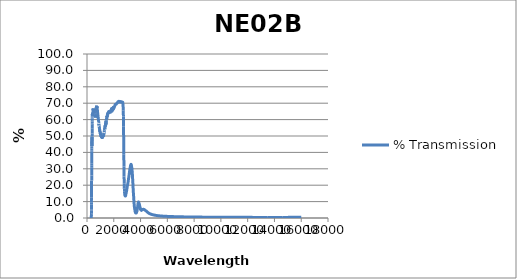
| Category | % Transmission |
|---|---|
| 200.0 | 0.013 |
| 201.0 | 0.013 |
| 202.0 | 0.013 |
| 203.0 | 0.013 |
| 204.0 | 0.012 |
| 205.0 | 0.012 |
| 206.0 | 0.012 |
| 207.0 | 0.012 |
| 208.0 | 0.012 |
| 209.0 | 0.012 |
| 210.0 | 0.012 |
| 211.0 | 0.012 |
| 212.0 | 0.012 |
| 213.0 | 0.012 |
| 214.0 | 0.012 |
| 215.0 | 0.011 |
| 216.0 | 0.011 |
| 217.0 | 0.011 |
| 218.0 | 0.011 |
| 219.0 | 0.011 |
| 220.0 | 0.011 |
| 221.0 | 0.011 |
| 222.0 | 0.011 |
| 223.0 | 0.011 |
| 224.0 | 0.011 |
| 225.0 | 0.011 |
| 226.0 | 0.011 |
| 227.0 | 0.01 |
| 228.0 | 0.01 |
| 229.0 | 0.01 |
| 230.0 | 0.01 |
| 231.0 | 0.01 |
| 232.0 | 0.01 |
| 233.0 | 0.01 |
| 234.0 | 0.01 |
| 235.0 | 0.01 |
| 236.0 | 0.01 |
| 237.0 | 0.01 |
| 238.0 | 0.01 |
| 239.0 | 0.01 |
| 240.0 | 0.01 |
| 241.0 | 0.01 |
| 242.0 | 0.01 |
| 243.0 | 0.009 |
| 244.0 | 0.009 |
| 245.0 | 0.009 |
| 246.0 | 0.009 |
| 247.0 | 0.009 |
| 248.0 | 0.009 |
| 249.0 | 0.009 |
| 250.0 | 0.009 |
| 251.0 | 0.009 |
| 252.0 | 0.009 |
| 253.0 | 0.009 |
| 254.0 | 0.009 |
| 255.0 | 0.009 |
| 256.0 | 0.009 |
| 257.0 | 0.009 |
| 258.0 | 0.009 |
| 259.0 | 0.009 |
| 260.0 | 0.009 |
| 261.0 | 0.009 |
| 262.0 | 0.009 |
| 263.0 | 0.009 |
| 264.0 | 0.009 |
| 265.0 | 0.009 |
| 266.0 | 0.009 |
| 267.0 | 0.009 |
| 268.0 | 0.009 |
| 269.0 | 0.009 |
| 270.0 | 0.009 |
| 271.0 | 0.008 |
| 272.0 | 0.008 |
| 273.0 | 0.008 |
| 274.0 | 0.008 |
| 275.0 | 0.008 |
| 276.0 | 0.008 |
| 277.0 | 0.008 |
| 278.0 | 0.008 |
| 279.0 | 0.008 |
| 280.0 | 0.008 |
| 281.0 | 0.008 |
| 282.0 | 0.008 |
| 283.0 | 0.008 |
| 284.0 | 0.008 |
| 285.0 | 0.008 |
| 286.0 | 0.008 |
| 287.0 | 0.008 |
| 288.0 | 0.008 |
| 289.0 | 0.008 |
| 290.0 | 0.008 |
| 291.0 | 0.008 |
| 292.0 | 0.008 |
| 293.0 | 0.008 |
| 294.0 | 0.008 |
| 295.0 | 0.008 |
| 296.0 | 0.008 |
| 297.0 | 0.008 |
| 298.0 | 0.008 |
| 299.0 | 0.008 |
| 300.0 | 0.008 |
| 301.0 | 0.008 |
| 302.0 | 0.008 |
| 303.0 | 0.008 |
| 304.0 | 0.008 |
| 305.0 | 0.008 |
| 306.0 | 0.008 |
| 307.0 | 0.008 |
| 308.0 | 0.008 |
| 309.0 | 0.008 |
| 310.0 | 0.008 |
| 311.0 | 0.008 |
| 312.0 | 0.008 |
| 313.0 | 0.009 |
| 314.0 | 0.011 |
| 315.0 | 0.016 |
| 316.0 | 0.022 |
| 317.0 | 0.034 |
| 318.0 | 0.053 |
| 319.0 | 0.081 |
| 320.0 | 0.127 |
| 321.0 | 0.194 |
| 322.0 | 0.287 |
| 323.0 | 0.41 |
| 324.0 | 0.577 |
| 325.0 | 0.793 |
| 326.0 | 1.073 |
| 327.0 | 1.433 |
| 328.0 | 1.862 |
| 329.0 | 2.364 |
| 330.0 | 2.967 |
| 331.0 | 3.663 |
| 332.0 | 4.435 |
| 333.0 | 5.303 |
| 334.0 | 6.253 |
| 335.0 | 7.253 |
| 336.0 | 8.367 |
| 337.0 | 9.606 |
| 338.0 | 10.901 |
| 339.0 | 12.318 |
| 340.0 | 13.746 |
| 341.0 | 15.164 |
| 342.0 | 16.639 |
| 343.0 | 18.122 |
| 344.0 | 19.688 |
| 345.0 | 21.264 |
| 346.0 | 22.906 |
| 347.0 | 24.326 |
| 348.0 | 25.872 |
| 349.0 | 27.447 |
| 350.0 | 29.057 |
| 351.0 | 30.707 |
| 352.0 | 32.213 |
| 353.0 | 33.413 |
| 354.0 | 34.816 |
| 355.0 | 36.194 |
| 356.0 | 37.643 |
| 357.0 | 39.02 |
| 358.0 | 40.383 |
| 359.0 | 41.299 |
| 360.0 | 42.458 |
| 361.0 | 43.499 |
| 362.0 | 44.703 |
| 363.0 | 45.731 |
| 364.0 | 46.632 |
| 365.0 | 47.212 |
| 366.0 | 47.957 |
| 367.0 | 48.43 |
| 368.0 | 48.937 |
| 369.0 | 49.25 |
| 370.0 | 49.314 |
| 371.0 | 48.723 |
| 372.0 | 48.054 |
| 373.0 | 47.087 |
| 374.0 | 46.159 |
| 375.0 | 45.372 |
| 376.0 | 44.64 |
| 377.0 | 43.928 |
| 378.0 | 44.196 |
| 379.0 | 44.756 |
| 380.0 | 45.746 |
| 381.0 | 46.799 |
| 382.0 | 48.221 |
| 383.0 | 49.705 |
| 384.0 | 51.522 |
| 385.0 | 53.045 |
| 386.0 | 54.459 |
| 387.0 | 55.481 |
| 388.0 | 56.783 |
| 389.0 | 57.703 |
| 390.0 | 58.885 |
| 391.0 | 59.675 |
| 392.0 | 60.417 |
| 393.0 | 60.727 |
| 394.0 | 61.287 |
| 395.0 | 61.758 |
| 396.0 | 62.334 |
| 397.0 | 62.838 |
| 398.0 | 63.112 |
| 399.0 | 62.916 |
| 400.0 | 63.097 |
| 401.0 | 63.12 |
| 402.0 | 63.299 |
| 403.0 | 63.527 |
| 404.0 | 63.59 |
| 405.0 | 63.069 |
| 406.0 | 62.974 |
| 407.0 | 62.906 |
| 408.0 | 62.964 |
| 409.0 | 63.005 |
| 410.0 | 62.853 |
| 411.0 | 62.405 |
| 412.0 | 62.361 |
| 413.0 | 62.341 |
| 414.0 | 62.458 |
| 415.0 | 62.719 |
| 416.0 | 62.662 |
| 417.0 | 62.395 |
| 418.0 | 62.497 |
| 419.0 | 62.627 |
| 420.0 | 62.879 |
| 421.0 | 63.283 |
| 422.0 | 63.294 |
| 423.0 | 63.146 |
| 424.0 | 63.333 |
| 425.0 | 63.527 |
| 426.0 | 63.712 |
| 427.0 | 64.071 |
| 428.0 | 64.093 |
| 429.0 | 63.886 |
| 430.0 | 63.949 |
| 431.0 | 64.034 |
| 432.0 | 64.107 |
| 433.0 | 64.234 |
| 434.0 | 64.039 |
| 435.0 | 63.797 |
| 436.0 | 63.673 |
| 437.0 | 63.647 |
| 438.0 | 63.694 |
| 439.0 | 63.963 |
| 440.0 | 63.905 |
| 441.0 | 63.61 |
| 442.0 | 63.604 |
| 443.0 | 63.735 |
| 444.0 | 64.02 |
| 445.0 | 64.393 |
| 446.0 | 64.431 |
| 447.0 | 64.377 |
| 448.0 | 64.585 |
| 449.0 | 64.785 |
| 450.0 | 65.208 |
| 451.0 | 65.613 |
| 452.0 | 65.655 |
| 453.0 | 65.566 |
| 454.0 | 65.671 |
| 455.0 | 65.81 |
| 456.0 | 66.205 |
| 457.0 | 66.426 |
| 458.0 | 66.477 |
| 459.0 | 66.272 |
| 460.0 | 66.177 |
| 461.0 | 66.302 |
| 462.0 | 66.548 |
| 463.0 | 66.801 |
| 464.0 | 66.602 |
| 465.0 | 66.244 |
| 466.0 | 66.255 |
| 467.0 | 66.245 |
| 468.0 | 66.424 |
| 469.0 | 66.683 |
| 470.0 | 66.384 |
| 471.0 | 66.065 |
| 472.0 | 65.952 |
| 473.0 | 65.96 |
| 474.0 | 66.188 |
| 475.0 | 66.217 |
| 476.0 | 65.993 |
| 477.0 | 65.609 |
| 478.0 | 65.48 |
| 479.0 | 65.42 |
| 480.0 | 65.6 |
| 481.0 | 65.798 |
| 482.0 | 65.504 |
| 483.0 | 65.126 |
| 484.0 | 65.067 |
| 485.0 | 64.989 |
| 486.0 | 65.187 |
| 487.0 | 65.355 |
| 488.0 | 65.022 |
| 489.0 | 64.738 |
| 490.0 | 64.678 |
| 491.0 | 64.636 |
| 492.0 | 64.829 |
| 493.0 | 64.973 |
| 494.0 | 64.66 |
| 495.0 | 64.371 |
| 496.0 | 64.374 |
| 497.0 | 64.416 |
| 498.0 | 64.631 |
| 499.0 | 64.7 |
| 500.0 | 64.408 |
| 501.0 | 64.168 |
| 502.0 | 64.163 |
| 503.0 | 64.223 |
| 504.0 | 64.494 |
| 505.0 | 64.661 |
| 506.0 | 64.324 |
| 507.0 | 64.098 |
| 508.0 | 64.105 |
| 509.0 | 64.165 |
| 510.0 | 64.419 |
| 511.0 | 64.55 |
| 512.0 | 64.285 |
| 513.0 | 64.129 |
| 514.0 | 64.222 |
| 515.0 | 64.311 |
| 516.0 | 64.58 |
| 517.0 | 64.801 |
| 518.0 | 64.59 |
| 519.0 | 64.412 |
| 520.0 | 64.449 |
| 521.0 | 64.554 |
| 522.0 | 64.868 |
| 523.0 | 65.079 |
| 524.0 | 64.82 |
| 525.0 | 64.666 |
| 526.0 | 64.8 |
| 527.0 | 64.931 |
| 528.0 | 65.223 |
| 529.0 | 65.427 |
| 530.0 | 65.214 |
| 531.0 | 65.211 |
| 532.0 | 65.467 |
| 533.0 | 65.666 |
| 534.0 | 65.881 |
| 535.0 | 65.864 |
| 536.0 | 65.664 |
| 537.0 | 65.699 |
| 538.0 | 65.906 |
| 539.0 | 66.042 |
| 540.0 | 66.251 |
| 541.0 | 66.246 |
| 542.0 | 65.919 |
| 543.0 | 65.699 |
| 544.0 | 65.758 |
| 545.0 | 66.005 |
| 546.0 | 66.199 |
| 547.0 | 66.272 |
| 548.0 | 65.957 |
| 549.0 | 65.742 |
| 550.0 | 65.804 |
| 551.0 | 65.977 |
| 552.0 | 66.165 |
| 553.0 | 65.864 |
| 554.0 | 65.698 |
| 555.0 | 65.58 |
| 556.0 | 65.509 |
| 557.0 | 65.589 |
| 558.0 | 65.719 |
| 559.0 | 65.654 |
| 560.0 | 65.371 |
| 561.0 | 65.462 |
| 562.0 | 65.224 |
| 563.0 | 65.041 |
| 564.0 | 64.976 |
| 565.0 | 64.914 |
| 566.0 | 65.068 |
| 567.0 | 64.851 |
| 568.0 | 64.512 |
| 569.0 | 64.311 |
| 570.0 | 64.187 |
| 571.0 | 64.19 |
| 572.0 | 64.358 |
| 573.0 | 64.108 |
| 574.0 | 63.828 |
| 575.0 | 63.672 |
| 576.0 | 63.527 |
| 577.0 | 63.532 |
| 578.0 | 63.605 |
| 579.0 | 63.378 |
| 580.0 | 62.993 |
| 581.0 | 62.826 |
| 582.0 | 62.7 |
| 583.0 | 62.811 |
| 584.0 | 62.937 |
| 585.0 | 62.676 |
| 586.0 | 62.475 |
| 587.0 | 62.327 |
| 588.0 | 62.226 |
| 589.0 | 62.406 |
| 590.0 | 62.502 |
| 591.0 | 62.298 |
| 592.0 | 62.157 |
| 593.0 | 62.154 |
| 594.0 | 61.995 |
| 595.0 | 62.24 |
| 596.0 | 62.413 |
| 597.0 | 62.241 |
| 598.0 | 62.028 |
| 599.0 | 62.252 |
| 600.0 | 62.346 |
| 601.0 | 62.527 |
| 602.0 | 62.513 |
| 603.0 | 62.291 |
| 604.0 | 62.16 |
| 605.0 | 62.37 |
| 606.0 | 62.393 |
| 607.0 | 62.66 |
| 608.0 | 62.693 |
| 609.0 | 62.467 |
| 610.0 | 62.339 |
| 611.0 | 62.356 |
| 612.0 | 62.342 |
| 613.0 | 62.507 |
| 614.0 | 62.709 |
| 615.0 | 62.527 |
| 616.0 | 62.416 |
| 617.0 | 62.359 |
| 618.0 | 62.463 |
| 619.0 | 62.673 |
| 620.0 | 62.845 |
| 621.0 | 62.573 |
| 622.0 | 62.552 |
| 623.0 | 62.542 |
| 624.0 | 62.389 |
| 625.0 | 62.828 |
| 626.0 | 62.879 |
| 627.0 | 62.654 |
| 628.0 | 62.519 |
| 629.0 | 62.271 |
| 630.0 | 62.335 |
| 631.0 | 62.432 |
| 632.0 | 62.54 |
| 633.0 | 62.189 |
| 634.0 | 62.05 |
| 635.0 | 62.085 |
| 636.0 | 62.09 |
| 637.0 | 62.21 |
| 638.0 | 62.225 |
| 639.0 | 61.822 |
| 640.0 | 61.72 |
| 641.0 | 61.534 |
| 642.0 | 61.703 |
| 643.0 | 61.693 |
| 644.0 | 61.839 |
| 645.0 | 61.439 |
| 646.0 | 61.448 |
| 647.0 | 61.387 |
| 648.0 | 61.498 |
| 649.0 | 61.57 |
| 650.0 | 61.726 |
| 651.0 | 61.361 |
| 652.0 | 61.375 |
| 653.0 | 61.356 |
| 654.0 | 61.444 |
| 655.0 | 61.72 |
| 656.0 | 61.714 |
| 657.0 | 61.399 |
| 658.0 | 61.38 |
| 659.0 | 61.5 |
| 660.0 | 61.57 |
| 661.0 | 61.804 |
| 662.0 | 61.882 |
| 663.0 | 61.595 |
| 664.0 | 61.635 |
| 665.0 | 61.99 |
| 666.0 | 62.1 |
| 667.0 | 62.342 |
| 668.0 | 62.547 |
| 669.0 | 62.351 |
| 670.0 | 62.448 |
| 671.0 | 62.578 |
| 672.0 | 63.045 |
| 673.0 | 63.205 |
| 674.0 | 63.199 |
| 675.0 | 63.142 |
| 676.0 | 63.243 |
| 677.0 | 63.507 |
| 678.0 | 63.803 |
| 679.0 | 64.212 |
| 680.0 | 64.326 |
| 681.0 | 64.395 |
| 682.0 | 64.582 |
| 683.0 | 64.975 |
| 684.0 | 65.131 |
| 685.0 | 65.557 |
| 686.0 | 65.524 |
| 687.0 | 65.56 |
| 688.0 | 65.475 |
| 689.0 | 66.263 |
| 690.0 | 66.017 |
| 691.0 | 66.068 |
| 692.0 | 66.515 |
| 693.0 | 66.788 |
| 694.0 | 66.64 |
| 695.0 | 66.829 |
| 696.0 | 66.799 |
| 697.0 | 67.285 |
| 698.0 | 67.675 |
| 699.0 | 67.321 |
| 700.0 | 67.228 |
| 701.0 | 67.576 |
| 702.0 | 67.47 |
| 703.0 | 67.94 |
| 704.0 | 67.986 |
| 705.0 | 67.965 |
| 706.0 | 67.807 |
| 707.0 | 67.828 |
| 708.0 | 67.623 |
| 709.0 | 68.048 |
| 710.0 | 68.373 |
| 711.0 | 67.916 |
| 712.0 | 68.039 |
| 713.0 | 68.099 |
| 714.0 | 68.017 |
| 715.0 | 68.283 |
| 716.0 | 68.453 |
| 717.0 | 68.149 |
| 718.0 | 68.119 |
| 719.0 | 68.043 |
| 720.0 | 67.848 |
| 721.0 | 68.224 |
| 722.0 | 68.27 |
| 723.0 | 68.084 |
| 724.0 | 67.908 |
| 725.0 | 67.86 |
| 726.0 | 67.899 |
| 727.0 | 68.003 |
| 728.0 | 68.2 |
| 729.0 | 67.943 |
| 730.0 | 67.807 |
| 731.0 | 67.487 |
| 732.0 | 67.531 |
| 733.0 | 67.835 |
| 734.0 | 68.055 |
| 735.0 | 67.661 |
| 736.0 | 67.386 |
| 737.0 | 67.369 |
| 738.0 | 67.287 |
| 739.0 | 67.425 |
| 740.0 | 67.656 |
| 741.0 | 67.251 |
| 742.0 | 67.194 |
| 743.0 | 67.217 |
| 744.0 | 66.968 |
| 745.0 | 66.986 |
| 746.0 | 67.442 |
| 747.0 | 67.111 |
| 748.0 | 66.765 |
| 749.0 | 66.726 |
| 750.0 | 66.597 |
| 751.0 | 66.716 |
| 752.0 | 66.821 |
| 753.0 | 66.494 |
| 754.0 | 66.257 |
| 755.0 | 66.3 |
| 756.0 | 66.178 |
| 757.0 | 66.315 |
| 758.0 | 66.315 |
| 759.0 | 66.064 |
| 760.0 | 65.88 |
| 761.0 | 65.784 |
| 762.0 | 65.799 |
| 763.0 | 65.947 |
| 764.0 | 65.832 |
| 765.0 | 65.611 |
| 766.0 | 65.432 |
| 767.0 | 65.336 |
| 768.0 | 65.336 |
| 769.0 | 65.505 |
| 770.0 | 65.496 |
| 771.0 | 65.174 |
| 772.0 | 64.985 |
| 773.0 | 65.122 |
| 774.0 | 64.907 |
| 775.0 | 64.929 |
| 776.0 | 65.696 |
| 777.0 | 65.63 |
| 778.0 | 65.559 |
| 779.0 | 65.479 |
| 780.0 | 65.41 |
| 781.0 | 65.325 |
| 782.0 | 65.247 |
| 783.0 | 65.173 |
| 784.0 | 65.099 |
| 785.0 | 65.02 |
| 786.0 | 64.944 |
| 787.0 | 64.855 |
| 788.0 | 64.777 |
| 789.0 | 64.714 |
| 790.0 | 64.637 |
| 791.0 | 64.561 |
| 792.0 | 64.486 |
| 793.0 | 64.396 |
| 794.0 | 64.321 |
| 795.0 | 64.255 |
| 796.0 | 64.183 |
| 797.0 | 64.097 |
| 798.0 | 64.018 |
| 799.0 | 63.932 |
| 800.0 | 63.853 |
| 801.0 | 63.788 |
| 802.0 | 63.718 |
| 803.0 | 63.634 |
| 804.0 | 63.566 |
| 805.0 | 63.485 |
| 806.0 | 63.415 |
| 807.0 | 63.351 |
| 808.0 | 63.28 |
| 809.0 | 63.199 |
| 810.0 | 63.134 |
| 811.0 | 63.05 |
| 812.0 | 62.957 |
| 813.0 | 62.885 |
| 814.0 | 62.81 |
| 815.0 | 62.743 |
| 816.0 | 62.681 |
| 817.0 | 62.593 |
| 818.0 | 62.503 |
| 819.0 | 62.426 |
| 820.0 | 62.352 |
| 821.0 | 62.288 |
| 822.0 | 62.234 |
| 823.0 | 62.153 |
| 824.0 | 62.064 |
| 825.0 | 61.991 |
| 826.0 | 61.929 |
| 827.0 | 61.865 |
| 828.0 | 61.801 |
| 829.0 | 61.721 |
| 830.0 | 61.638 |
| 831.0 | 61.571 |
| 832.0 | 61.509 |
| 833.0 | 61.443 |
| 834.0 | 61.389 |
| 835.0 | 61.323 |
| 836.0 | 61.25 |
| 837.0 | 61.183 |
| 838.0 | 61.109 |
| 839.0 | 61.041 |
| 840.0 | 60.981 |
| 841.0 | 60.908 |
| 842.0 | 60.836 |
| 843.0 | 60.768 |
| 844.0 | 60.694 |
| 845.0 | 60.621 |
| 846.0 | 60.567 |
| 847.0 | 60.519 |
| 848.0 | 60.462 |
| 849.0 | 60.395 |
| 850.0 | 60.318 |
| 851.0 | 60.255 |
| 852.0 | 60.205 |
| 853.0 | 60.136 |
| 854.0 | 60.07 |
| 855.0 | 60.01 |
| 856.0 | 59.946 |
| 857.0 | 59.884 |
| 858.0 | 59.828 |
| 859.0 | 59.773 |
| 860.0 | 59.711 |
| 861.0 | 59.641 |
| 862.0 | 59.556 |
| 863.0 | 59.502 |
| 864.0 | 59.462 |
| 865.0 | 59.401 |
| 866.0 | 59.307 |
| 867.0 | 59.183 |
| 868.0 | 59.049 |
| 869.0 | 58.93 |
| 870.0 | 58.856 |
| 871.0 | 58.779 |
| 872.0 | 58.616 |
| 873.0 | 58.389 |
| 874.0 | 58.199 |
| 875.0 | 58.126 |
| 876.0 | 58.142 |
| 877.0 | 58.14 |
| 878.0 | 58.084 |
| 879.0 | 57.991 |
| 880.0 | 57.882 |
| 881.0 | 57.714 |
| 882.0 | 57.51 |
| 883.0 | 57.35 |
| 884.0 | 57.201 |
| 885.0 | 57.049 |
| 886.0 | 56.918 |
| 887.0 | 56.853 |
| 888.0 | 56.824 |
| 889.0 | 56.78 |
| 890.0 | 56.715 |
| 891.0 | 56.643 |
| 892.0 | 56.569 |
| 893.0 | 56.492 |
| 894.0 | 56.458 |
| 895.0 | 56.52 |
| 896.0 | 56.603 |
| 897.0 | 56.625 |
| 898.0 | 56.565 |
| 899.0 | 56.414 |
| 900.0 | 56.199 |
| 901.0 | 56.025 |
| 902.0 | 55.966 |
| 903.0 | 55.958 |
| 904.0 | 55.963 |
| 905.0 | 55.98 |
| 906.0 | 55.959 |
| 907.0 | 55.918 |
| 908.0 | 55.855 |
| 909.0 | 55.775 |
| 910.0 | 55.765 |
| 911.0 | 55.783 |
| 912.0 | 55.729 |
| 913.0 | 55.587 |
| 914.0 | 55.482 |
| 915.0 | 55.455 |
| 916.0 | 55.448 |
| 917.0 | 55.372 |
| 918.0 | 55.269 |
| 919.0 | 55.219 |
| 920.0 | 55.095 |
| 921.0 | 54.908 |
| 922.0 | 54.822 |
| 923.0 | 54.868 |
| 924.0 | 54.917 |
| 925.0 | 54.87 |
| 926.0 | 54.729 |
| 927.0 | 54.639 |
| 928.0 | 54.641 |
| 929.0 | 54.638 |
| 930.0 | 54.61 |
| 931.0 | 54.638 |
| 932.0 | 54.677 |
| 933.0 | 54.549 |
| 934.0 | 54.333 |
| 935.0 | 54.235 |
| 936.0 | 54.239 |
| 937.0 | 54.274 |
| 938.0 | 54.306 |
| 939.0 | 54.209 |
| 940.0 | 54.021 |
| 941.0 | 53.885 |
| 942.0 | 53.855 |
| 943.0 | 53.9 |
| 944.0 | 53.938 |
| 945.0 | 53.914 |
| 946.0 | 53.794 |
| 947.0 | 53.679 |
| 948.0 | 53.657 |
| 949.0 | 53.712 |
| 950.0 | 53.706 |
| 951.0 | 53.574 |
| 952.0 | 53.467 |
| 953.0 | 53.466 |
| 954.0 | 53.435 |
| 955.0 | 53.28 |
| 956.0 | 53.165 |
| 957.0 | 53.103 |
| 958.0 | 53.113 |
| 959.0 | 53.152 |
| 960.0 | 53.08 |
| 961.0 | 52.945 |
| 962.0 | 52.868 |
| 963.0 | 52.934 |
| 964.0 | 52.96 |
| 965.0 | 52.872 |
| 966.0 | 52.824 |
| 967.0 | 52.805 |
| 968.0 | 52.745 |
| 969.0 | 52.747 |
| 970.0 | 52.748 |
| 971.0 | 52.636 |
| 972.0 | 52.448 |
| 973.0 | 52.382 |
| 974.0 | 52.393 |
| 975.0 | 52.446 |
| 976.0 | 52.39 |
| 977.0 | 52.314 |
| 978.0 | 52.303 |
| 979.0 | 52.265 |
| 980.0 | 52.226 |
| 981.0 | 52.115 |
| 982.0 | 52.086 |
| 983.0 | 52.106 |
| 984.0 | 52.087 |
| 985.0 | 52.042 |
| 986.0 | 52.029 |
| 987.0 | 52.033 |
| 988.0 | 51.988 |
| 989.0 | 51.848 |
| 990.0 | 51.746 |
| 991.0 | 51.694 |
| 992.0 | 51.633 |
| 993.0 | 51.663 |
| 994.0 | 51.73 |
| 995.0 | 51.771 |
| 996.0 | 51.695 |
| 997.0 | 51.602 |
| 998.0 | 51.542 |
| 999.0 | 51.492 |
| 1000.0 | 51.443 |
| 1001.0 | 51.411 |
| 1002.0 | 51.475 |
| 1003.0 | 51.517 |
| 1004.0 | 51.479 |
| 1005.0 | 51.36 |
| 1006.0 | 51.255 |
| 1007.0 | 51.25 |
| 1008.0 | 51.299 |
| 1009.0 | 51.264 |
| 1010.0 | 51.133 |
| 1011.0 | 51.034 |
| 1012.0 | 51.111 |
| 1013.0 | 51.201 |
| 1014.0 | 51.232 |
| 1015.0 | 51.232 |
| 1016.0 | 51.093 |
| 1017.0 | 50.919 |
| 1018.0 | 50.876 |
| 1019.0 | 50.918 |
| 1020.0 | 50.975 |
| 1021.0 | 50.899 |
| 1022.0 | 50.865 |
| 1023.0 | 50.823 |
| 1024.0 | 50.809 |
| 1025.0 | 50.719 |
| 1026.0 | 50.629 |
| 1027.0 | 50.609 |
| 1028.0 | 50.599 |
| 1029.0 | 50.687 |
| 1030.0 | 50.685 |
| 1031.0 | 50.583 |
| 1032.0 | 50.477 |
| 1033.0 | 50.467 |
| 1034.0 | 50.496 |
| 1035.0 | 50.506 |
| 1036.0 | 50.48 |
| 1037.0 | 50.46 |
| 1038.0 | 50.373 |
| 1039.0 | 50.31 |
| 1040.0 | 50.262 |
| 1041.0 | 50.207 |
| 1042.0 | 50.232 |
| 1043.0 | 50.252 |
| 1044.0 | 50.272 |
| 1045.0 | 50.222 |
| 1046.0 | 50.161 |
| 1047.0 | 50.087 |
| 1048.0 | 50.139 |
| 1049.0 | 50.202 |
| 1050.0 | 50.272 |
| 1051.0 | 50.301 |
| 1052.0 | 50.145 |
| 1053.0 | 49.964 |
| 1054.0 | 49.861 |
| 1055.0 | 49.804 |
| 1056.0 | 49.863 |
| 1057.0 | 49.905 |
| 1058.0 | 49.839 |
| 1059.0 | 49.753 |
| 1060.0 | 49.654 |
| 1061.0 | 49.618 |
| 1062.0 | 49.7 |
| 1063.0 | 49.783 |
| 1064.0 | 49.83 |
| 1065.0 | 49.754 |
| 1066.0 | 49.655 |
| 1067.0 | 49.593 |
| 1068.0 | 49.627 |
| 1069.0 | 49.698 |
| 1070.0 | 49.716 |
| 1071.0 | 49.613 |
| 1072.0 | 49.564 |
| 1073.0 | 49.504 |
| 1074.0 | 49.459 |
| 1075.0 | 49.502 |
| 1076.0 | 49.545 |
| 1077.0 | 49.583 |
| 1078.0 | 49.644 |
| 1079.0 | 49.701 |
| 1080.0 | 49.776 |
| 1081.0 | 49.721 |
| 1082.0 | 49.65 |
| 1083.0 | 49.653 |
| 1084.0 | 49.64 |
| 1085.0 | 49.569 |
| 1086.0 | 49.632 |
| 1087.0 | 49.665 |
| 1088.0 | 49.627 |
| 1089.0 | 49.612 |
| 1090.0 | 49.587 |
| 1091.0 | 49.508 |
| 1092.0 | 49.438 |
| 1093.0 | 49.407 |
| 1094.0 | 49.484 |
| 1095.0 | 49.513 |
| 1096.0 | 49.52 |
| 1097.0 | 49.506 |
| 1098.0 | 49.463 |
| 1099.0 | 49.412 |
| 1100.0 | 49.356 |
| 1101.0 | 49.309 |
| 1102.0 | 49.231 |
| 1103.0 | 49.144 |
| 1104.0 | 49.243 |
| 1105.0 | 49.336 |
| 1106.0 | 49.319 |
| 1107.0 | 49.327 |
| 1108.0 | 49.275 |
| 1109.0 | 49.098 |
| 1110.0 | 48.908 |
| 1111.0 | 48.854 |
| 1112.0 | 48.892 |
| 1113.0 | 48.936 |
| 1114.0 | 49.001 |
| 1115.0 | 49.081 |
| 1116.0 | 49.158 |
| 1117.0 | 49.086 |
| 1118.0 | 49.055 |
| 1119.0 | 49.059 |
| 1120.0 | 49.117 |
| 1121.0 | 49.237 |
| 1122.0 | 49.361 |
| 1123.0 | 49.437 |
| 1124.0 | 49.451 |
| 1125.0 | 49.385 |
| 1126.0 | 49.343 |
| 1127.0 | 49.343 |
| 1128.0 | 49.317 |
| 1129.0 | 49.37 |
| 1130.0 | 49.421 |
| 1131.0 | 49.439 |
| 1132.0 | 49.363 |
| 1133.0 | 49.391 |
| 1134.0 | 49.432 |
| 1135.0 | 49.49 |
| 1136.0 | 49.547 |
| 1137.0 | 49.575 |
| 1138.0 | 49.562 |
| 1139.0 | 49.517 |
| 1140.0 | 49.494 |
| 1141.0 | 49.413 |
| 1142.0 | 49.318 |
| 1143.0 | 49.2 |
| 1144.0 | 49.023 |
| 1145.0 | 48.882 |
| 1146.0 | 48.847 |
| 1147.0 | 48.957 |
| 1148.0 | 49.043 |
| 1149.0 | 49.124 |
| 1150.0 | 49.121 |
| 1151.0 | 49.169 |
| 1152.0 | 49.187 |
| 1153.0 | 49.168 |
| 1154.0 | 49.19 |
| 1155.0 | 49.314 |
| 1156.0 | 49.344 |
| 1157.0 | 49.278 |
| 1158.0 | 49.104 |
| 1159.0 | 48.973 |
| 1160.0 | 48.958 |
| 1161.0 | 49.024 |
| 1162.0 | 49.141 |
| 1163.0 | 49.261 |
| 1164.0 | 49.372 |
| 1165.0 | 49.44 |
| 1166.0 | 49.512 |
| 1167.0 | 49.607 |
| 1168.0 | 49.712 |
| 1169.0 | 49.779 |
| 1170.0 | 49.714 |
| 1171.0 | 49.655 |
| 1172.0 | 49.561 |
| 1173.0 | 49.447 |
| 1174.0 | 49.334 |
| 1175.0 | 49.245 |
| 1176.0 | 49.218 |
| 1177.0 | 49.263 |
| 1178.0 | 49.403 |
| 1179.0 | 49.561 |
| 1180.0 | 49.703 |
| 1181.0 | 49.84 |
| 1182.0 | 49.958 |
| 1183.0 | 49.982 |
| 1184.0 | 49.969 |
| 1185.0 | 49.937 |
| 1186.0 | 49.912 |
| 1187.0 | 49.924 |
| 1188.0 | 50.025 |
| 1189.0 | 50.176 |
| 1190.0 | 50.306 |
| 1191.0 | 50.367 |
| 1192.0 | 50.388 |
| 1193.0 | 50.374 |
| 1194.0 | 50.356 |
| 1195.0 | 50.333 |
| 1196.0 | 50.335 |
| 1197.0 | 50.392 |
| 1198.0 | 50.523 |
| 1199.0 | 50.633 |
| 1200.0 | 50.624 |
| 1201.0 | 50.549 |
| 1202.0 | 50.535 |
| 1203.0 | 50.557 |
| 1204.0 | 50.607 |
| 1205.0 | 50.689 |
| 1206.0 | 50.752 |
| 1207.0 | 50.734 |
| 1208.0 | 50.712 |
| 1209.0 | 50.672 |
| 1210.0 | 50.624 |
| 1211.0 | 50.559 |
| 1212.0 | 50.449 |
| 1213.0 | 50.353 |
| 1214.0 | 50.325 |
| 1215.0 | 50.339 |
| 1216.0 | 50.389 |
| 1217.0 | 50.457 |
| 1218.0 | 50.541 |
| 1219.0 | 50.66 |
| 1220.0 | 50.729 |
| 1221.0 | 50.694 |
| 1222.0 | 50.703 |
| 1223.0 | 50.792 |
| 1224.0 | 50.847 |
| 1225.0 | 50.818 |
| 1226.0 | 50.76 |
| 1227.0 | 50.666 |
| 1228.0 | 50.535 |
| 1229.0 | 50.44 |
| 1230.0 | 50.389 |
| 1231.0 | 50.309 |
| 1232.0 | 50.255 |
| 1233.0 | 50.215 |
| 1234.0 | 50.218 |
| 1235.0 | 50.293 |
| 1236.0 | 50.371 |
| 1237.0 | 50.429 |
| 1238.0 | 50.479 |
| 1239.0 | 50.542 |
| 1240.0 | 50.612 |
| 1241.0 | 50.675 |
| 1242.0 | 50.703 |
| 1243.0 | 50.724 |
| 1244.0 | 50.762 |
| 1245.0 | 50.776 |
| 1246.0 | 50.758 |
| 1247.0 | 50.749 |
| 1248.0 | 50.793 |
| 1249.0 | 50.889 |
| 1250.0 | 51.002 |
| 1251.0 | 51.11 |
| 1252.0 | 51.195 |
| 1253.0 | 51.241 |
| 1254.0 | 51.302 |
| 1255.0 | 51.375 |
| 1256.0 | 51.422 |
| 1257.0 | 51.436 |
| 1258.0 | 51.413 |
| 1259.0 | 51.451 |
| 1260.0 | 51.555 |
| 1261.0 | 51.676 |
| 1262.0 | 51.704 |
| 1263.0 | 51.635 |
| 1264.0 | 51.578 |
| 1265.0 | 51.536 |
| 1266.0 | 51.506 |
| 1267.0 | 51.482 |
| 1268.0 | 51.476 |
| 1269.0 | 51.501 |
| 1270.0 | 51.528 |
| 1271.0 | 51.561 |
| 1272.0 | 51.6 |
| 1273.0 | 51.626 |
| 1274.0 | 51.64 |
| 1275.0 | 51.692 |
| 1276.0 | 51.828 |
| 1277.0 | 51.984 |
| 1278.0 | 52.131 |
| 1279.0 | 52.251 |
| 1280.0 | 52.302 |
| 1281.0 | 52.284 |
| 1282.0 | 52.23 |
| 1283.0 | 52.211 |
| 1284.0 | 52.229 |
| 1285.0 | 52.292 |
| 1286.0 | 52.416 |
| 1287.0 | 52.529 |
| 1288.0 | 52.617 |
| 1289.0 | 52.697 |
| 1290.0 | 52.789 |
| 1291.0 | 52.867 |
| 1292.0 | 52.936 |
| 1293.0 | 53.005 |
| 1294.0 | 53.04 |
| 1295.0 | 53.072 |
| 1296.0 | 53.134 |
| 1297.0 | 53.205 |
| 1298.0 | 53.267 |
| 1299.0 | 53.334 |
| 1300.0 | 53.368 |
| 1301.0 | 53.3 |
| 1302.0 | 53.227 |
| 1303.0 | 53.267 |
| 1304.0 | 53.393 |
| 1305.0 | 53.524 |
| 1306.0 | 53.588 |
| 1307.0 | 53.617 |
| 1308.0 | 53.661 |
| 1309.0 | 53.639 |
| 1310.0 | 53.606 |
| 1311.0 | 53.624 |
| 1312.0 | 53.678 |
| 1313.0 | 53.757 |
| 1314.0 | 53.847 |
| 1315.0 | 53.944 |
| 1316.0 | 54.041 |
| 1317.0 | 54.104 |
| 1318.0 | 54.141 |
| 1319.0 | 54.144 |
| 1320.0 | 54.137 |
| 1321.0 | 54.127 |
| 1322.0 | 54.099 |
| 1323.0 | 54.087 |
| 1324.0 | 54.199 |
| 1325.0 | 54.365 |
| 1326.0 | 54.469 |
| 1327.0 | 54.537 |
| 1328.0 | 54.561 |
| 1329.0 | 54.506 |
| 1330.0 | 54.405 |
| 1331.0 | 54.327 |
| 1332.0 | 54.371 |
| 1333.0 | 54.426 |
| 1334.0 | 54.436 |
| 1335.0 | 54.42 |
| 1336.0 | 54.371 |
| 1337.0 | 54.323 |
| 1338.0 | 54.284 |
| 1339.0 | 54.335 |
| 1340.0 | 54.511 |
| 1341.0 | 54.756 |
| 1342.0 | 55.033 |
| 1343.0 | 55.225 |
| 1344.0 | 55.283 |
| 1345.0 | 55.243 |
| 1346.0 | 55.323 |
| 1347.0 | 55.479 |
| 1348.0 | 55.658 |
| 1349.0 | 55.723 |
| 1350.0 | 55.77 |
| 1351.0 | 55.809 |
| 1352.0 | 55.76 |
| 1353.0 | 55.707 |
| 1354.0 | 55.769 |
| 1355.0 | 56.025 |
| 1356.0 | 56.311 |
| 1357.0 | 56.416 |
| 1358.0 | 56.299 |
| 1359.0 | 56.045 |
| 1360.0 | 55.889 |
| 1361.0 | 56.105 |
| 1362.0 | 56.352 |
| 1363.0 | 56.346 |
| 1364.0 | 56.24 |
| 1365.0 | 56.067 |
| 1366.0 | 55.753 |
| 1367.0 | 55.656 |
| 1368.0 | 55.828 |
| 1369.0 | 55.874 |
| 1370.0 | 55.866 |
| 1371.0 | 56.003 |
| 1372.0 | 56.159 |
| 1373.0 | 56.14 |
| 1374.0 | 56.167 |
| 1375.0 | 56.53 |
| 1376.0 | 57.017 |
| 1377.0 | 57.345 |
| 1378.0 | 57.176 |
| 1379.0 | 56.612 |
| 1380.0 | 56.247 |
| 1381.0 | 56.314 |
| 1382.0 | 56.782 |
| 1383.0 | 57.197 |
| 1384.0 | 57.162 |
| 1385.0 | 56.913 |
| 1386.0 | 56.797 |
| 1387.0 | 56.895 |
| 1388.0 | 57.282 |
| 1389.0 | 57.735 |
| 1390.0 | 57.74 |
| 1391.0 | 57.604 |
| 1392.0 | 57.602 |
| 1393.0 | 57.346 |
| 1394.0 | 56.95 |
| 1395.0 | 57.095 |
| 1396.0 | 57.551 |
| 1397.0 | 57.393 |
| 1398.0 | 56.849 |
| 1399.0 | 56.512 |
| 1400.0 | 56.736 |
| 1401.0 | 57.266 |
| 1402.0 | 57.74 |
| 1403.0 | 58.025 |
| 1404.0 | 58.173 |
| 1405.0 | 58.066 |
| 1406.0 | 57.82 |
| 1407.0 | 57.599 |
| 1408.0 | 57.68 |
| 1409.0 | 57.961 |
| 1410.0 | 58.008 |
| 1411.0 | 57.687 |
| 1412.0 | 57.445 |
| 1413.0 | 57.655 |
| 1414.0 | 58.04 |
| 1415.0 | 58.247 |
| 1416.0 | 58.516 |
| 1417.0 | 58.667 |
| 1418.0 | 58.46 |
| 1419.0 | 58.216 |
| 1420.0 | 58.496 |
| 1421.0 | 58.899 |
| 1422.0 | 59.013 |
| 1423.0 | 58.659 |
| 1424.0 | 58.325 |
| 1425.0 | 58.358 |
| 1426.0 | 58.556 |
| 1427.0 | 58.7 |
| 1428.0 | 58.871 |
| 1429.0 | 59.091 |
| 1430.0 | 59.365 |
| 1431.0 | 59.49 |
| 1432.0 | 59.483 |
| 1433.0 | 59.572 |
| 1434.0 | 59.761 |
| 1435.0 | 59.851 |
| 1436.0 | 59.837 |
| 1437.0 | 59.623 |
| 1438.0 | 59.504 |
| 1439.0 | 59.505 |
| 1440.0 | 59.616 |
| 1441.0 | 59.695 |
| 1442.0 | 59.71 |
| 1443.0 | 59.668 |
| 1444.0 | 59.705 |
| 1445.0 | 59.836 |
| 1446.0 | 59.904 |
| 1447.0 | 59.861 |
| 1448.0 | 59.894 |
| 1449.0 | 60.007 |
| 1450.0 | 60.153 |
| 1451.0 | 60.239 |
| 1452.0 | 60.306 |
| 1453.0 | 60.205 |
| 1454.0 | 60.134 |
| 1455.0 | 60.074 |
| 1456.0 | 60.019 |
| 1457.0 | 59.99 |
| 1458.0 | 60.137 |
| 1459.0 | 60.286 |
| 1460.0 | 60.308 |
| 1461.0 | 60.317 |
| 1462.0 | 60.451 |
| 1463.0 | 60.606 |
| 1464.0 | 60.64 |
| 1465.0 | 60.517 |
| 1466.0 | 60.544 |
| 1467.0 | 60.574 |
| 1468.0 | 60.611 |
| 1469.0 | 60.684 |
| 1470.0 | 60.867 |
| 1471.0 | 61.037 |
| 1472.0 | 61.006 |
| 1473.0 | 60.894 |
| 1474.0 | 60.825 |
| 1475.0 | 60.824 |
| 1476.0 | 60.99 |
| 1477.0 | 61.072 |
| 1478.0 | 61.124 |
| 1479.0 | 61.108 |
| 1480.0 | 61.083 |
| 1481.0 | 61.116 |
| 1482.0 | 61.093 |
| 1483.0 | 61.212 |
| 1484.0 | 61.335 |
| 1485.0 | 61.358 |
| 1486.0 | 61.352 |
| 1487.0 | 61.389 |
| 1488.0 | 61.585 |
| 1489.0 | 61.776 |
| 1490.0 | 61.959 |
| 1491.0 | 61.97 |
| 1492.0 | 61.821 |
| 1493.0 | 61.644 |
| 1494.0 | 61.574 |
| 1495.0 | 61.669 |
| 1496.0 | 61.801 |
| 1497.0 | 61.936 |
| 1498.0 | 62.082 |
| 1499.0 | 62.184 |
| 1500.0 | 62.212 |
| 1501.0 | 62.108 |
| 1502.0 | 62.058 |
| 1503.0 | 62.056 |
| 1504.0 | 62.102 |
| 1505.0 | 62.223 |
| 1506.0 | 62.363 |
| 1507.0 | 62.427 |
| 1508.0 | 62.34 |
| 1509.0 | 62.253 |
| 1510.0 | 62.234 |
| 1511.0 | 62.287 |
| 1512.0 | 62.341 |
| 1513.0 | 62.395 |
| 1514.0 | 62.45 |
| 1515.0 | 62.546 |
| 1516.0 | 62.634 |
| 1517.0 | 62.623 |
| 1518.0 | 62.653 |
| 1519.0 | 62.771 |
| 1520.0 | 62.832 |
| 1521.0 | 62.733 |
| 1522.0 | 62.64 |
| 1523.0 | 62.657 |
| 1524.0 | 62.777 |
| 1525.0 | 62.877 |
| 1526.0 | 62.991 |
| 1527.0 | 62.965 |
| 1528.0 | 62.911 |
| 1529.0 | 62.797 |
| 1530.0 | 62.761 |
| 1531.0 | 62.88 |
| 1532.0 | 62.987 |
| 1533.0 | 63.053 |
| 1534.0 | 63.012 |
| 1535.0 | 62.941 |
| 1536.0 | 62.876 |
| 1537.0 | 62.904 |
| 1538.0 | 63.069 |
| 1539.0 | 63.223 |
| 1540.0 | 63.269 |
| 1541.0 | 63.114 |
| 1542.0 | 62.907 |
| 1543.0 | 62.824 |
| 1544.0 | 62.885 |
| 1545.0 | 62.998 |
| 1546.0 | 63.08 |
| 1547.0 | 63.195 |
| 1548.0 | 63.335 |
| 1549.0 | 63.415 |
| 1550.0 | 63.433 |
| 1551.0 | 63.342 |
| 1552.0 | 63.271 |
| 1553.0 | 63.227 |
| 1554.0 | 63.281 |
| 1555.0 | 63.334 |
| 1556.0 | 63.403 |
| 1557.0 | 63.479 |
| 1558.0 | 63.579 |
| 1559.0 | 63.588 |
| 1560.0 | 63.482 |
| 1561.0 | 63.395 |
| 1562.0 | 63.396 |
| 1563.0 | 63.518 |
| 1564.0 | 63.75 |
| 1565.0 | 63.816 |
| 1566.0 | 63.734 |
| 1567.0 | 63.704 |
| 1568.0 | 63.732 |
| 1569.0 | 63.774 |
| 1570.0 | 63.776 |
| 1571.0 | 63.686 |
| 1572.0 | 63.496 |
| 1573.0 | 63.475 |
| 1574.0 | 63.673 |
| 1575.0 | 63.908 |
| 1576.0 | 64.104 |
| 1577.0 | 64.171 |
| 1578.0 | 64.141 |
| 1579.0 | 63.966 |
| 1580.0 | 63.814 |
| 1581.0 | 63.754 |
| 1582.0 | 63.83 |
| 1583.0 | 64.002 |
| 1584.0 | 64.168 |
| 1585.0 | 64.233 |
| 1586.0 | 64.19 |
| 1587.0 | 64.069 |
| 1588.0 | 64.092 |
| 1589.0 | 64.174 |
| 1590.0 | 64.171 |
| 1591.0 | 64.059 |
| 1592.0 | 63.894 |
| 1593.0 | 63.744 |
| 1594.0 | 63.648 |
| 1595.0 | 63.686 |
| 1596.0 | 63.714 |
| 1597.0 | 63.745 |
| 1598.0 | 63.742 |
| 1599.0 | 63.751 |
| 1600.0 | 63.767 |
| 1601.0 | 63.876 |
| 1602.0 | 64.157 |
| 1603.0 | 64.419 |
| 1604.0 | 64.5 |
| 1605.0 | 64.446 |
| 1606.0 | 64.399 |
| 1607.0 | 64.29 |
| 1608.0 | 64.175 |
| 1609.0 | 64.126 |
| 1610.0 | 64.185 |
| 1611.0 | 64.242 |
| 1612.0 | 64.284 |
| 1613.0 | 64.351 |
| 1614.0 | 64.44 |
| 1615.0 | 64.533 |
| 1616.0 | 64.607 |
| 1617.0 | 64.696 |
| 1618.0 | 64.784 |
| 1619.0 | 64.832 |
| 1620.0 | 64.801 |
| 1621.0 | 64.779 |
| 1622.0 | 64.725 |
| 1623.0 | 64.664 |
| 1624.0 | 64.577 |
| 1625.0 | 64.432 |
| 1626.0 | 64.296 |
| 1627.0 | 64.242 |
| 1628.0 | 64.267 |
| 1629.0 | 64.286 |
| 1630.0 | 64.328 |
| 1631.0 | 64.403 |
| 1632.0 | 64.47 |
| 1633.0 | 64.437 |
| 1634.0 | 64.389 |
| 1635.0 | 64.444 |
| 1636.0 | 64.524 |
| 1637.0 | 64.584 |
| 1638.0 | 64.637 |
| 1639.0 | 64.616 |
| 1640.0 | 64.527 |
| 1641.0 | 64.502 |
| 1642.0 | 64.528 |
| 1643.0 | 64.546 |
| 1644.0 | 64.562 |
| 1645.0 | 64.611 |
| 1646.0 | 64.645 |
| 1647.0 | 64.593 |
| 1648.0 | 64.554 |
| 1649.0 | 64.578 |
| 1650.0 | 64.612 |
| 1651.0 | 64.632 |
| 1652.0 | 64.656 |
| 1653.0 | 64.679 |
| 1654.0 | 64.697 |
| 1655.0 | 64.724 |
| 1656.0 | 64.729 |
| 1657.0 | 64.683 |
| 1658.0 | 64.632 |
| 1659.0 | 64.587 |
| 1660.0 | 64.538 |
| 1661.0 | 64.528 |
| 1662.0 | 64.616 |
| 1663.0 | 64.778 |
| 1664.0 | 64.869 |
| 1665.0 | 64.872 |
| 1666.0 | 64.859 |
| 1667.0 | 64.862 |
| 1668.0 | 64.884 |
| 1669.0 | 64.977 |
| 1670.0 | 65.187 |
| 1671.0 | 65.314 |
| 1672.0 | 65.288 |
| 1673.0 | 65.246 |
| 1674.0 | 65.206 |
| 1675.0 | 65.144 |
| 1676.0 | 65.071 |
| 1677.0 | 65.029 |
| 1678.0 | 65.014 |
| 1679.0 | 65.111 |
| 1680.0 | 65.261 |
| 1681.0 | 65.284 |
| 1682.0 | 65.24 |
| 1683.0 | 65.197 |
| 1684.0 | 65.177 |
| 1685.0 | 65.18 |
| 1686.0 | 65.174 |
| 1687.0 | 65.165 |
| 1688.0 | 65.17 |
| 1689.0 | 65.193 |
| 1690.0 | 65.142 |
| 1691.0 | 64.962 |
| 1692.0 | 64.791 |
| 1693.0 | 64.656 |
| 1694.0 | 64.592 |
| 1695.0 | 64.606 |
| 1696.0 | 64.656 |
| 1697.0 | 64.715 |
| 1698.0 | 64.756 |
| 1699.0 | 64.836 |
| 1700.0 | 64.908 |
| 1701.0 | 64.919 |
| 1702.0 | 64.8 |
| 1703.0 | 64.636 |
| 1704.0 | 64.569 |
| 1705.0 | 64.586 |
| 1706.0 | 64.619 |
| 1707.0 | 64.632 |
| 1708.0 | 64.635 |
| 1709.0 | 64.642 |
| 1710.0 | 64.65 |
| 1711.0 | 64.674 |
| 1712.0 | 64.7 |
| 1713.0 | 64.751 |
| 1714.0 | 64.916 |
| 1715.0 | 65.056 |
| 1716.0 | 65.104 |
| 1717.0 | 65.012 |
| 1718.0 | 64.891 |
| 1719.0 | 64.817 |
| 1720.0 | 64.767 |
| 1721.0 | 64.731 |
| 1722.0 | 64.682 |
| 1723.0 | 64.618 |
| 1724.0 | 64.576 |
| 1725.0 | 64.677 |
| 1726.0 | 64.821 |
| 1727.0 | 64.902 |
| 1728.0 | 64.942 |
| 1729.0 | 65.004 |
| 1730.0 | 65.093 |
| 1731.0 | 65.191 |
| 1732.0 | 65.231 |
| 1733.0 | 65.126 |
| 1734.0 | 64.955 |
| 1735.0 | 64.773 |
| 1736.0 | 64.697 |
| 1737.0 | 64.617 |
| 1738.0 | 64.523 |
| 1739.0 | 64.454 |
| 1740.0 | 64.565 |
| 1741.0 | 64.698 |
| 1742.0 | 64.727 |
| 1743.0 | 64.712 |
| 1744.0 | 64.722 |
| 1745.0 | 64.715 |
| 1746.0 | 64.729 |
| 1747.0 | 64.792 |
| 1748.0 | 64.838 |
| 1749.0 | 64.904 |
| 1750.0 | 64.988 |
| 1751.0 | 64.991 |
| 1752.0 | 64.844 |
| 1753.0 | 64.723 |
| 1754.0 | 64.615 |
| 1755.0 | 64.548 |
| 1756.0 | 64.612 |
| 1757.0 | 64.734 |
| 1758.0 | 64.848 |
| 1759.0 | 64.881 |
| 1760.0 | 64.87 |
| 1761.0 | 64.855 |
| 1762.0 | 64.874 |
| 1763.0 | 64.888 |
| 1764.0 | 64.91 |
| 1765.0 | 65.001 |
| 1766.0 | 65.101 |
| 1767.0 | 65.18 |
| 1768.0 | 65.235 |
| 1769.0 | 65.282 |
| 1770.0 | 65.243 |
| 1771.0 | 65.056 |
| 1772.0 | 64.776 |
| 1773.0 | 64.512 |
| 1774.0 | 64.409 |
| 1775.0 | 64.481 |
| 1776.0 | 64.674 |
| 1777.0 | 64.865 |
| 1778.0 | 64.893 |
| 1779.0 | 64.797 |
| 1780.0 | 64.713 |
| 1781.0 | 64.774 |
| 1782.0 | 64.893 |
| 1783.0 | 64.966 |
| 1784.0 | 64.893 |
| 1785.0 | 64.802 |
| 1786.0 | 64.821 |
| 1787.0 | 64.843 |
| 1788.0 | 64.802 |
| 1789.0 | 64.725 |
| 1790.0 | 64.657 |
| 1791.0 | 64.662 |
| 1792.0 | 64.654 |
| 1793.0 | 64.71 |
| 1794.0 | 64.93 |
| 1795.0 | 65.26 |
| 1796.0 | 65.562 |
| 1797.0 | 65.768 |
| 1798.0 | 65.835 |
| 1799.0 | 65.575 |
| 1800.0 | 65.375 |
| 1801.0 | 65.491 |
| 1802.0 | 65.731 |
| 1803.0 | 65.855 |
| 1804.0 | 65.699 |
| 1805.0 | 65.516 |
| 1806.0 | 65.453 |
| 1807.0 | 65.659 |
| 1808.0 | 65.795 |
| 1809.0 | 65.619 |
| 1810.0 | 65.504 |
| 1811.0 | 65.556 |
| 1812.0 | 65.7 |
| 1813.0 | 65.857 |
| 1814.0 | 66.048 |
| 1815.0 | 66.239 |
| 1816.0 | 66.24 |
| 1817.0 | 65.95 |
| 1818.0 | 65.405 |
| 1819.0 | 64.918 |
| 1820.0 | 64.922 |
| 1821.0 | 65.354 |
| 1822.0 | 65.909 |
| 1823.0 | 66.124 |
| 1824.0 | 65.947 |
| 1825.0 | 65.775 |
| 1826.0 | 65.776 |
| 1827.0 | 65.791 |
| 1828.0 | 65.756 |
| 1829.0 | 65.676 |
| 1830.0 | 65.742 |
| 1831.0 | 66.102 |
| 1832.0 | 66.291 |
| 1833.0 | 66.252 |
| 1834.0 | 65.953 |
| 1835.0 | 65.829 |
| 1836.0 | 65.734 |
| 1837.0 | 65.478 |
| 1838.0 | 64.958 |
| 1839.0 | 64.683 |
| 1840.0 | 65 |
| 1841.0 | 65.891 |
| 1842.0 | 66.882 |
| 1843.0 | 67.141 |
| 1844.0 | 66.429 |
| 1845.0 | 65.291 |
| 1846.0 | 64.557 |
| 1847.0 | 64.899 |
| 1848.0 | 65.59 |
| 1849.0 | 65.977 |
| 1850.0 | 66.119 |
| 1851.0 | 65.99 |
| 1852.0 | 65.875 |
| 1853.0 | 65.774 |
| 1854.0 | 65.523 |
| 1855.0 | 65.551 |
| 1856.0 | 65.659 |
| 1857.0 | 65.773 |
| 1858.0 | 65.753 |
| 1859.0 | 65.824 |
| 1860.0 | 66.115 |
| 1861.0 | 66.641 |
| 1862.0 | 67.003 |
| 1863.0 | 66.981 |
| 1864.0 | 66.565 |
| 1865.0 | 65.982 |
| 1866.0 | 65.484 |
| 1867.0 | 65.521 |
| 1868.0 | 66.036 |
| 1869.0 | 66.42 |
| 1870.0 | 66.182 |
| 1871.0 | 65.601 |
| 1872.0 | 65.225 |
| 1873.0 | 65.367 |
| 1874.0 | 65.666 |
| 1875.0 | 65.906 |
| 1876.0 | 66.045 |
| 1877.0 | 66.125 |
| 1878.0 | 66.317 |
| 1879.0 | 66.466 |
| 1880.0 | 66.626 |
| 1881.0 | 66.519 |
| 1882.0 | 66.247 |
| 1883.0 | 65.943 |
| 1884.0 | 65.884 |
| 1885.0 | 65.89 |
| 1886.0 | 65.945 |
| 1887.0 | 65.956 |
| 1888.0 | 65.924 |
| 1889.0 | 65.99 |
| 1890.0 | 66.012 |
| 1891.0 | 66.139 |
| 1892.0 | 66.592 |
| 1893.0 | 67.112 |
| 1894.0 | 67.513 |
| 1895.0 | 67.635 |
| 1896.0 | 67.292 |
| 1897.0 | 66.824 |
| 1898.0 | 66.45 |
| 1899.0 | 66.222 |
| 1900.0 | 66.326 |
| 1901.0 | 66.397 |
| 1902.0 | 66.34 |
| 1903.0 | 66.107 |
| 1904.0 | 65.946 |
| 1905.0 | 66.003 |
| 1906.0 | 66.308 |
| 1907.0 | 66.499 |
| 1908.0 | 66.611 |
| 1909.0 | 66.603 |
| 1910.0 | 66.501 |
| 1911.0 | 66.362 |
| 1912.0 | 66.356 |
| 1913.0 | 66.617 |
| 1914.0 | 66.908 |
| 1915.0 | 66.874 |
| 1916.0 | 66.423 |
| 1917.0 | 65.866 |
| 1918.0 | 65.54 |
| 1919.0 | 65.655 |
| 1920.0 | 66.124 |
| 1921.0 | 66.573 |
| 1922.0 | 66.692 |
| 1923.0 | 66.417 |
| 1924.0 | 66.094 |
| 1925.0 | 66.017 |
| 1926.0 | 66.274 |
| 1927.0 | 66.645 |
| 1928.0 | 66.79 |
| 1929.0 | 66.633 |
| 1930.0 | 66.411 |
| 1931.0 | 66.286 |
| 1932.0 | 66.24 |
| 1933.0 | 66.346 |
| 1934.0 | 66.573 |
| 1935.0 | 66.641 |
| 1936.0 | 66.605 |
| 1937.0 | 66.38 |
| 1938.0 | 66.183 |
| 1939.0 | 66.257 |
| 1940.0 | 66.521 |
| 1941.0 | 66.839 |
| 1942.0 | 66.988 |
| 1943.0 | 66.92 |
| 1944.0 | 66.806 |
| 1945.0 | 66.786 |
| 1946.0 | 66.802 |
| 1947.0 | 66.892 |
| 1948.0 | 67.024 |
| 1949.0 | 67.145 |
| 1950.0 | 67.247 |
| 1951.0 | 67.235 |
| 1952.0 | 67.051 |
| 1953.0 | 66.911 |
| 1954.0 | 66.967 |
| 1955.0 | 67.091 |
| 1956.0 | 67.105 |
| 1957.0 | 67.038 |
| 1958.0 | 67.045 |
| 1959.0 | 67.108 |
| 1960.0 | 67.197 |
| 1961.0 | 67.322 |
| 1962.0 | 67.335 |
| 1963.0 | 67.191 |
| 1964.0 | 67.065 |
| 1965.0 | 67.147 |
| 1966.0 | 67.364 |
| 1967.0 | 67.522 |
| 1968.0 | 67.601 |
| 1969.0 | 67.68 |
| 1970.0 | 67.631 |
| 1971.0 | 67.548 |
| 1972.0 | 67.528 |
| 1973.0 | 67.511 |
| 1974.0 | 67.64 |
| 1975.0 | 67.903 |
| 1976.0 | 68.042 |
| 1977.0 | 67.998 |
| 1978.0 | 67.962 |
| 1979.0 | 68.053 |
| 1980.0 | 68.137 |
| 1981.0 | 68.168 |
| 1982.0 | 68.092 |
| 1983.0 | 68.004 |
| 1984.0 | 67.808 |
| 1985.0 | 67.554 |
| 1986.0 | 67.498 |
| 1987.0 | 67.525 |
| 1988.0 | 67.454 |
| 1989.0 | 67.367 |
| 1990.0 | 67.374 |
| 1991.0 | 67.391 |
| 1992.0 | 67.414 |
| 1993.0 | 67.546 |
| 1994.0 | 67.642 |
| 1995.0 | 67.543 |
| 1996.0 | 67.452 |
| 1997.0 | 67.427 |
| 1998.0 | 67.395 |
| 1999.0 | 67.381 |
| 2000.065834 | 67.253 |
| 2009.942668 | 67.098 |
| 2020.098566 | 67.126 |
| 2029.969298 | 67.392 |
| 2039.837 | 67.711 |
| 2049.98346 | 67.978 |
| 2059.844971 | 68.107 |
| 2069.985031 | 68.391 |
| 2079.840289 | 68.5 |
| 2089.973887 | 68.738 |
| 2099.822832 | 68.957 |
| 2109.949906 | 69.211 |
| 2119.792477 | 69.248 |
| 2129.912964 | 69.149 |
| 2140.030088 | 69.21 |
| 2149.862941 | 69.3 |
| 2159.973384 | 69.425 |
| 2169.799712 | 69.405 |
| 2179.903413 | 69.387 |
| 2190.003671 | 69.451 |
| 2199.820052 | 69.553 |
| 2209.913475 | 69.728 |
| 2219.723179 | 69.86 |
| 2229.809704 | 69.894 |
| 2239.892708 | 70.055 |
| 2249.692237 | 70.004 |
| 2259.76825 | 70.19 |
| 2269.840694 | 70.228 |
| 2279.909553 | 70.461 |
| 2289.695271 | 70.61 |
| 2299.757015 | 70.74 |
| 2309.815127 | 70.873 |
| 2319.869592 | 70.915 |
| 2329.641254 | 70.944 |
| 2339.688478 | 70.887 |
| 2349.732008 | 70.889 |
| 2359.771828 | 71.01 |
| 2369.80792 | 71.078 |
| 2379.840271 | 71.139 |
| 2389.590342 | 71.035 |
| 2399.615266 | 70.918 |
| 2409.6364 | 70.776 |
| 2419.65373 | 70.696 |
| 2429.667238 | 70.762 |
| 2439.676909 | 70.822 |
| 2449.682728 | 70.887 |
| 2459.684679 | 71.01 |
| 2469.682745 | 71.053 |
| 2479.676911 | 71.028 |
| 2489.667162 | 70.927 |
| 2499.653481 | 70.793 |
| 2509.635853 | 70.693 |
| 2519.614261 | 70.631 |
| 2529.588691 | 70.681 |
| 2539.559127 | 70.856 |
| 2549.525552 | 70.835 |
| 2559.487951 | 70.904 |
| 2569.722871 | 70.912 |
| 2579.677058 | 70.909 |
| 2589.627171 | 70.615 |
| 2599.573195 | 70.53 |
| 2609.515113 | 70.429 |
| 2619.452911 | 70.491 |
| 2629.662448 | 70.436 |
| 2639.591842 | 70.347 |
| 2649.517067 | 70.517 |
| 2659.438109 | 70.46 |
| 2669.630358 | 70.526 |
| 2679.542867 | 69.823 |
| 2689.451145 | 69.095 |
| 2699.630227 | 67.7 |
| 2709.529877 | 65.765 |
| 2719.425248 | 61.847 |
| 2729.591015 | 55.668 |
| 2739.477662 | 47.532 |
| 2749.359982 | 38.896 |
| 2759.512287 | 31.406 |
| 2769.385788 | 25.344 |
| 2779.528995 | 21.14 |
| 2789.393611 | 18.155 |
| 2799.527654 | 16.374 |
| 2809.383323 | 15.149 |
| 2819.508136 | 14.282 |
| 2829.354792 | 13.885 |
| 2839.47031 | 13.658 |
| 2849.30789 | 13.538 |
| 2859.414046 | 13.435 |
| 2869.515434 | 13.402 |
| 2879.339216 | 13.538 |
| 2889.431143 | 13.873 |
| 2899.24569 | 14.288 |
| 2909.328092 | 14.712 |
| 2919.40564 | 14.903 |
| 2929.206149 | 15.278 |
| 2939.274073 | 15.765 |
| 2949.337095 | 16.286 |
| 2959.395197 | 16.713 |
| 2969.17672 | 17.294 |
| 2979.225066 | 17.849 |
| 2989.268442 | 18.378 |
| 2999.306833 | 18.823 |
| 3009.34022 | 19.28 |
| 3019.368587 | 19.805 |
| 3029.391918 | 20.088 |
| 3039.139497 | 20.531 |
| 3049.152842 | 20.934 |
| 3059.1611 | 21.374 |
| 3069.164256 | 21.823 |
| 3079.162292 | 22.384 |
| 3089.155191 | 23.069 |
| 3099.142938 | 23.811 |
| 3109.125515 | 24.278 |
| 3119.102905 | 24.887 |
| 3129.075093 | 25.294 |
| 3139.311366 | 25.893 |
| 3149.272956 | 26.486 |
| 3159.229293 | 27.128 |
| 3169.18036 | 27.747 |
| 3179.126141 | 28.42 |
| 3189.066618 | 29.054 |
| 3199.27022 | 29.644 |
| 3209.199897 | 30.111 |
| 3219.124221 | 30.518 |
| 3229.043176 | 30.918 |
| 3239.224603 | 31.311 |
| 3249.132622 | 31.784 |
| 3259.035221 | 32.167 |
| 3269.199799 | 32.482 |
| 3279.091361 | 32.627 |
| 3288.977454 | 32.76 |
| 3299.125027 | 32.629 |
| 3308.999981 | 32.296 |
| 3319.136081 | 31.875 |
| 3328.999829 | 31.391 |
| 3339.124385 | 30.998 |
| 3348.976861 | 30.558 |
| 3359.089804 | 29.855 |
| 3368.930939 | 28.975 |
| 3379.0322 | 27.866 |
| 3389.127517 | 26.585 |
| 3398.951437 | 25.251 |
| 3409.034967 | 23.817 |
| 3419.112499 | 22.337 |
| 3428.919052 | 20.759 |
| 3438.984693 | 19.199 |
| 3449.044284 | 17.563 |
| 3458.833318 | 16.146 |
| 3468.880914 | 14.68 |
| 3478.922407 | 13.722 |
| 3488.957779 | 12.403 |
| 3498.987012 | 11.166 |
| 3509.010089 | 9.794 |
| 3519.026992 | 8.727 |
| 3529.037703 | 7.719 |
| 3538.779008 | 6.931 |
| 3548.777448 | 6.257 |
| 3558.769643 | 5.861 |
| 3568.755577 | 5.419 |
| 3578.997769 | 4.818 |
| 3588.970961 | 4.197 |
| 3598.937838 | 3.754 |
| 3608.898383 | 3.547 |
| 3618.852578 | 3.262 |
| 3628.800407 | 3.166 |
| 3638.74185 | 3.093 |
| 3648.938253 | 3.143 |
| 3658.866705 | 3.035 |
| 3668.788719 | 3.005 |
| 3678.704279 | 3.049 |
| 3688.874043 | 3.135 |
| 3698.776469 | 3.54 |
| 3708.672387 | 3.709 |
| 3718.821938 | 4.045 |
| 3728.704616 | 4.07 |
| 3738.840542 | 4.595 |
| 3748.709907 | 5.113 |
| 3758.832135 | 5.857 |
| 3768.688117 | 6.267 |
| 3778.796573 | 6.685 |
| 3788.639101 | 7.381 |
| 3798.733711 | 7.937 |
| 3808.821282 | 8.645 |
| 3818.643407 | 8.954 |
| 3828.717023 | 9.451 |
| 3838.783543 | 9.793 |
| 3848.585104 | 9.582 |
| 3858.637559 | 9.445 |
| 3868.682864 | 8.973 |
| 3878.720999 | 9.171 |
| 3888.751945 | 8.918 |
| 3898.518755 | 8.67 |
| 3908.535455 | 8.302 |
| 3918.54491 | 8.137 |
| 3928.547104 | 7.748 |
| 3938.542016 | 7.136 |
| 3948.52963 | 6.681 |
| 3958.509925 | 6.392 |
| 3968.482884 | 6.522 |
| 3978.70392 | 5.955 |
| 3988.661962 | 5.663 |
| 3998.612612 | 5.211 |
| 4008.555852 | 5.168 |
| 4018.491662 | 5.101 |
| 4028.6745 | 4.89 |
| 4038.595205 | 4.84 |
| 4048.508426 | 4.737 |
| 4058.414143 | 4.633 |
| 4068.56604 | 4.633 |
| 4078.456503 | 4.775 |
| 4088.592715 | 4.874 |
| 4098.467848 | 5.063 |
| 4108.588299 | 5.127 |
| 4118.448027 | 5.201 |
| 4128.552639 | 5.179 |
| 4138.396887 | 5.175 |
| 4148.485584 | 5.15 |
| 4158.566193 | 5.163 |
| 4168.386981 | 5.197 |
| 4178.45156 | 5.24 |
| 4188.507992 | 5.267 |
| 4198.305151 | 5.284 |
| 4208.345437 | 5.299 |
| 4218.377519 | 5.306 |
| 4228.401377 | 5.303 |
| 4238.416991 | 5.262 |
| 4248.424343 | 5.237 |
| 4258.423411 | 5.212 |
| 4268.414178 | 5.191 |
| 4278.396623 | 5.133 |
| 4288.370728 | 5.053 |
| 4298.336471 | 4.985 |
| 4308.293836 | 4.924 |
| 4318.2428 | 4.858 |
| 4328.431752 | 4.781 |
| 4338.363649 | 4.71 |
| 4348.287088 | 4.654 |
| 4358.20205 | 4.612 |
| 4368.356068 | 4.573 |
| 4378.253805 | 4.532 |
| 4388.390126 | 4.476 |
| 4398.270558 | 4.41 |
| 4408.389101 | 4.337 |
| 4418.252149 | 4.255 |
| 4428.352834 | 4.174 |
| 4438.198419 | 4.095 |
| 4448.281165 | 4.019 |
| 4458.354799 | 3.942 |
| 4468.173935 | 3.867 |
| 4478.229508 | 3.794 |
| 4488.275909 | 3.727 |
| 4498.313117 | 3.66 |
| 4508.096635 | 3.598 |
| 4518.115621 | 3.536 |
| 4528.125352 | 3.477 |
| 4538.125809 | 3.412 |
| 4548.11697 | 3.35 |
| 4558.098816 | 3.286 |
| 4568.071325 | 3.227 |
| 4578.277365 | 3.166 |
| 4588.230912 | 3.108 |
| 4598.175061 | 3.052 |
| 4608.109792 | 3 |
| 4618.035085 | 2.947 |
| 4628.192649 | 2.896 |
| 4638.098772 | 2.85 |
| 4647.995395 | 2.804 |
| 4658.123528 | 2.762 |
| 4668.000857 | 2.721 |
| 4678.109183 | 2.681 |
| 4687.967136 | 2.639 |
| 4698.05557 | 2.602 |
| 4708.133906 | 2.569 |
| 4717.962521 | 2.533 |
| 4728.020838 | 2.496 |
| 4738.068993 | 2.462 |
| 4748.106964 | 2.43 |
| 4758.13473 | 2.396 |
| 4767.913874 | 2.365 |
| 4777.921408 | 2.334 |
| 4787.918673 | 2.304 |
| 4797.905646 | 2.273 |
| 4807.882307 | 2.243 |
| 4818.085802 | 2.214 |
| 4828.041526 | 2.186 |
| 4837.986874 | 2.16 |
| 4847.921823 | 2.136 |
| 4857.846351 | 2.111 |
| 4867.996361 | 2.088 |
| 4877.899737 | 2.065 |
| 4888.028045 | 2.043 |
| 4897.910179 | 2.02 |
| 4908.016697 | 1.998 |
| 4917.877504 | 1.975 |
| 4927.962141 | 1.952 |
| 4937.801534 | 1.931 |
| 4947.864203 | 1.911 |
| 4957.915724 | 1.894 |
| 4967.956075 | 1.877 |
| 4977.985234 | 1.86 |
| 4987.77033 | 1.841 |
| 4997.777298 | 1.823 |
| 5007.776688 | 1.806 |
| 5017.595804 | 1.789 |
| 5028.169082 | 1.771 |
| 5037.98605 | 1.753 |
| 5047.80198 | 1.738 |
| 5057.616872 | 1.722 |
| 5068.18559 | 1.708 |
| 5077.998316 | 1.692 |
| 5087.809996 | 1.676 |
| 5097.620628 | 1.66 |
| 5107.430211 | 1.647 |
| 5117.993201 | 1.633 |
| 5127.800597 | 1.618 |
| 5137.606938 | 1.606 |
| 5147.41222 | 1.591 |
| 5157.970569 | 1.577 |
| 5167.773648 | 1.566 |
| 5177.575662 | 1.553 |
| 5187.376611 | 1.54 |
| 5197.930283 | 1.527 |
| 5207.729011 | 1.514 |
| 5217.526666 | 1.502 |
| 5227.323247 | 1.49 |
| 5237.872207 | 1.478 |
| 5247.666549 | 1.468 |
| 5257.459812 | 1.457 |
| 5268.005191 | 1.446 |
| 5277.796202 | 1.437 |
| 5287.586127 | 1.429 |
| 5297.374963 | 1.419 |
| 5307.915566 | 1.409 |
| 5317.702134 | 1.398 |
| 5327.487607 | 1.388 |
| 5337.271982 | 1.378 |
| 5347.807773 | 1.368 |
| 5357.589864 | 1.358 |
| 5367.370852 | 1.348 |
| 5377.902987 | 1.339 |
| 5387.681677 | 1.33 |
| 5397.459258 | 1.322 |
| 5407.235727 | 1.313 |
| 5417.762987 | 1.305 |
| 5427.537141 | 1.296 |
| 5437.310177 | 1.288 |
| 5447.833734 | 1.281 |
| 5457.604442 | 1.275 |
| 5467.374028 | 1.267 |
| 5477.142487 | 1.259 |
| 5487.661104 | 1.25 |
| 5497.427219 | 1.242 |
| 5507.192201 | 1.234 |
| 5517.707068 | 1.226 |
| 5527.469693 | 1.218 |
| 5537.231179 | 1.211 |
| 5547.742274 | 1.204 |
| 5557.50139 | 1.198 |
| 5567.259362 | 1.192 |
| 5577.766665 | 1.185 |
| 5587.522253 | 1.178 |
| 5597.276691 | 1.172 |
| 5607.780182 | 1.167 |
| 5617.532223 | 1.162 |
| 5627.283108 | 1.154 |
| 5637.032835 | 1.148 |
| 5647.531242 | 1.143 |
| 5657.278555 | 1.138 |
| 5667.024703 | 1.134 |
| 5677.51925 | 1.128 |
| 5687.262972 | 1.122 |
| 5697.005523 | 1.117 |
| 5707.496189 | 1.111 |
| 5717.236302 | 1.105 |
| 5726.975237 | 1.1 |
| 5737.462002 | 1.097 |
| 5747.198485 | 1.096 |
| 5757.682605 | 1.091 |
| 5767.416629 | 1.086 |
| 5777.149464 | 1.08 |
| 5787.629649 | 1.075 |
| 5797.360012 | 1.069 |
| 5807.08918 | 1.065 |
| 5817.565409 | 1.06 |
| 5827.292092 | 1.054 |
| 5837.017575 | 1.05 |
| 5847.489828 | 1.045 |
| 5857.212813 | 1.042 |
| 5866.934591 | 1.038 |
| 5877.402847 | 1.034 |
| 5887.122114 | 1.031 |
| 5897.587661 | 1.028 |
| 5907.304408 | 1.024 |
| 5917.019938 | 1.02 |
| 5927.481454 | 1.016 |
| 5937.194452 | 1.012 |
| 5946.906226 | 1.008 |
| 5957.363691 | 1.004 |
| 5967.072921 | 1.001 |
| 5977.52764 | 0.997 |
| 5987.234315 | 0.994 |
| 5996.939757 | 0.99 |
| 6007.39039 | 0.986 |
| 6017.093265 | 0.983 |
| 6026.794901 | 0.978 |
| 6037.241429 | 0.974 |
| 6046.940485 | 0.971 |
| 6057.38423 | 0.967 |
| 6067.080698 | 0.963 |
| 6076.775917 | 0.959 |
| 6087.215522 | 0.955 |
| 6096.908139 | 0.953 |
| 6107.344938 | 0.95 |
| 6117.034946 | 0.946 |
| 6126.723694 | 0.942 |
| 6137.156319 | 0.939 |
| 6146.842444 | 0.935 |
| 6157.272241 | 0.93 |
| 6166.955735 | 0.926 |
| 6177.382693 | 0.923 |
| 6187.063548 | 0.92 |
| 6196.743128 | 0.917 |
| 6207.165865 | 0.914 |
| 6216.842793 | 0.91 |
| 6227.262668 | 0.907 |
| 6236.936935 | 0.904 |
| 6246.609918 | 0.9 |
| 6257.025537 | 0.896 |
| 6266.695846 | 0.893 |
| 6277.108582 | 0.889 |
| 6286.776208 | 0.886 |
| 6297.18605 | 0.882 |
| 6306.850986 | 0.878 |
| 6317.257926 | 0.875 |
| 6326.920162 | 0.871 |
| 6336.581095 | 0.868 |
| 6346.983717 | 0.866 |
| 6356.641938 | 0.863 |
| 6367.041635 | 0.86 |
| 6376.697135 | 0.857 |
| 6387.093897 | 0.855 |
| 6396.746668 | 0.851 |
| 6407.140486 | 0.848 |
| 6416.790518 | 0.844 |
| 6427.181383 | 0.844 |
| 6436.828669 | 0.845 |
| 6446.47463 | 0.844 |
| 6456.861103 | 0.841 |
| 6466.504304 | 0.838 |
| 6476.8878 | 0.835 |
| 6486.528234 | 0.832 |
| 6496.908745 | 0.829 |
| 6506.546402 | 0.827 |
| 6516.923919 | 0.824 |
| 6526.558791 | 0.822 |
| 6536.933304 | 0.819 |
| 6546.565382 | 0.817 |
| 6556.936882 | 0.816 |
| 6566.566159 | 0.814 |
| 6576.934637 | 0.812 |
| 6586.561102 | 0.809 |
| 6596.926549 | 0.807 |
| 6606.550195 | 0.805 |
| 6616.912601 | 0.803 |
| 6626.53342 | 0.8 |
| 6636.892776 | 0.797 |
| 6646.510758 | 0.796 |
| 6656.867055 | 0.794 |
| 6666.482193 | 0.791 |
| 6676.835422 | 0.789 |
| 6686.447706 | 0.786 |
| 6696.797857 | 0.784 |
| 6706.40728 | 0.781 |
| 6716.754344 | 0.779 |
| 6726.360896 | 0.777 |
| 6736.704865 | 0.775 |
| 6746.308538 | 0.774 |
| 6756.649402 | 0.771 |
| 6766.250188 | 0.769 |
| 6776.587937 | 0.767 |
| 6786.924068 | 0.764 |
| 6796.520453 | 0.762 |
| 6806.853456 | 0.76 |
| 6816.446931 | 0.757 |
| 6826.776797 | 0.755 |
| 6836.367355 | 0.753 |
| 6846.694074 | 0.751 |
| 6856.281707 | 0.748 |
| 6866.60527 | 0.746 |
| 6876.189968 | 0.745 |
| 6886.510366 | 0.744 |
| 6896.82912 | 0.744 |
| 6906.409345 | 0.742 |
| 6916.724921 | 0.741 |
| 6926.30219 | 0.739 |
| 6936.614577 | 0.737 |
| 6946.188882 | 0.736 |
| 6956.498072 | 0.733 |
| 6966.805601 | 0.731 |
| 6976.375388 | 0.729 |
| 6986.679706 | 0.727 |
| 6996.246507 | 0.725 |
| 7006.547605 | 0.722 |
| 7016.111412 | 0.721 |
| 7026.40928 | 0.719 |
| 7036.70547 | 0.717 |
| 7046.264714 | 0.714 |
| 7056.557661 | 0.713 |
| 7066.113889 | 0.712 |
| 7076.403584 | 0.71 |
| 7086.691589 | 0.708 |
| 7096.243221 | 0.706 |
| 7106.527959 | 0.704 |
| 7116.076554 | 0.703 |
| 7126.358018 | 0.702 |
| 7136.637779 | 0.701 |
| 7146.181746 | 0.698 |
| 7156.458218 | 0.697 |
| 7165.999126 | 0.696 |
| 7176.2723 | 0.694 |
| 7186.54376 | 0.692 |
| 7196.080008 | 0.69 |
| 7206.348156 | 0.689 |
| 7216.614582 | 0.687 |
| 7226.14615 | 0.685 |
| 7236.409251 | 0.684 |
| 7245.937725 | 0.682 |
| 7256.197491 | 0.68 |
| 7266.455524 | 0.679 |
| 7275.979286 | 0.677 |
| 7286.23397 | 0.676 |
| 7296.486914 | 0.675 |
| 7306.005944 | 0.673 |
| 7316.255525 | 0.671 |
| 7326.503358 | 0.669 |
| 7336.017637 | 0.667 |
| 7346.262094 | 0.665 |
| 7356.504797 | 0.664 |
| 7366.014304 | 0.662 |
| 7376.253616 | 0.661 |
| 7386.491167 | 0.659 |
| 7395.995884 | 0.657 |
| 7406.23003 | 0.656 |
| 7416.462408 | 0.655 |
| 7425.962315 | 0.653 |
| 7436.191274 | 0.651 |
| 7446.418458 | 0.65 |
| 7455.913536 | 0.648 |
| 7466.137287 | 0.646 |
| 7476.359256 | 0.645 |
| 7485.849485 | 0.643 |
| 7496.068008 | 0.643 |
| 7506.284741 | 0.642 |
| 7515.770101 | 0.64 |
| 7525.983375 | 0.64 |
| 7536.19485 | 0.639 |
| 7545.675324 | 0.638 |
| 7555.883326 | 0.636 |
| 7566.089524 | 0.634 |
| 7576.293916 | 0.633 |
| 7585.767802 | 0.632 |
| 7595.968701 | 0.631 |
| 7606.167786 | 0.63 |
| 7615.636739 | 0.629 |
| 7625.832319 | 0.627 |
| 7636.026078 | 0.626 |
| 7646.218013 | 0.625 |
| 7655.680318 | 0.623 |
| 7665.868729 | 0.622 |
| 7676.05531 | 0.62 |
| 7686.240057 | 0.618 |
| 7695.695679 | 0.617 |
| 7705.876884 | 0.616 |
| 7716.056248 | 0.615 |
| 7726.23377 | 0.613 |
| 7735.682674 | 0.612 |
| 7745.856636 | 0.611 |
| 7756.028747 | 0.609 |
| 7766.199006 | 0.608 |
| 7775.641157 | 0.607 |
| 7785.807837 | 0.606 |
| 7795.972657 | 0.605 |
| 7806.135616 | 0.604 |
| 7815.57098 | 0.602 |
| 7825.730341 | 0.601 |
| 7835.887833 | 0.599 |
| 7846.043454 | 0.598 |
| 7855.471995 | 0.597 |
| 7865.624 | 0.596 |
| 7875.774127 | 0.595 |
| 7885.922372 | 0.594 |
| 7896.068734 | 0.593 |
| 7905.488668 | 0.591 |
| 7915.631391 | 0.59 |
| 7925.772224 | 0.589 |
| 7935.911164 | 0.588 |
| 7946.048209 | 0.588 |
| 7955.45948 | 0.587 |
| 7965.592863 | 0.586 |
| 7975.724343 | 0.585 |
| 7985.853919 | 0.584 |
| 7995.981587 | 0.583 |
| 8005.384141 | 0.583 |
| 8015.508125 | 0.582 |
| 8025.630194 | 0.581 |
| 8035.750346 | 0.58 |
| 8045.86858 | 0.579 |
| 8055.984892 | 0.578 |
| 8065.376887 | 0.576 |
| 8075.489487 | 0.575 |
| 8085.600158 | 0.575 |
| 8095.708897 | 0.575 |
| 8105.815704 | 0.575 |
| 8115.920574 | 0.574 |
| 8125.301933 | 0.573 |
| 8135.403063 | 0.573 |
| 8145.502251 | 0.572 |
| 8155.599493 | 0.571 |
| 8165.694787 | 0.57 |
| 8175.788131 | 0.569 |
| 8185.879523 | 0.569 |
| 8195.248351 | 0.568 |
| 8205.33597 | 0.567 |
| 8215.42163 | 0.566 |
| 8225.505327 | 0.564 |
| 8235.587061 | 0.563 |
| 8245.666827 | 0.562 |
| 8255.744624 | 0.561 |
| 8265.82045 | 0.56 |
| 8275.174806 | 0.559 |
| 8285.246822 | 0.558 |
| 8295.31686 | 0.557 |
| 8305.384917 | 0.557 |
| 8315.45099 | 0.556 |
| 8325.515077 | 0.554 |
| 8335.577176 | 0.553 |
| 8345.637284 | 0.552 |
| 8355.695399 | 0.551 |
| 8365.751519 | 0.55 |
| 8375.087555 | 0.549 |
| 8385.139819 | 0.549 |
| 8395.190081 | 0.548 |
| 8405.238338 | 0.547 |
| 8415.284587 | 0.546 |
| 8425.328827 | 0.545 |
| 8435.371055 | 0.545 |
| 8445.411268 | 0.544 |
| 8455.449464 | 0.543 |
| 8465.485641 | 0.542 |
| 8475.519796 | 0.541 |
| 8485.551927 | 0.54 |
| 8495.582031 | 0.539 |
| 8505.610107 | 0.538 |
| 8515.636151 | 0.537 |
| 8525.660162 | 0.538 |
| 8535.682136 | 0.538 |
| 8544.98643 | 0.538 |
| 8555.004471 | 0.538 |
| 8565.020468 | 0.537 |
| 8575.034421 | 0.536 |
| 8585.046325 | 0.535 |
| 8595.056179 | 0.535 |
| 8605.063981 | 0.533 |
| 8615.069727 | 0.532 |
| 8625.073416 | 0.532 |
| 8635.075045 | 0.532 |
| 8645.074612 | 0.531 |
| 8655.072114 | 0.53 |
| 8665.067549 | 0.53 |
| 8675.060915 | 0.529 |
| 8685.052209 | 0.528 |
| 8695.041429 | 0.527 |
| 8705.028573 | 0.526 |
| 8715.013637 | 0.525 |
| 8724.99662 | 0.523 |
| 8734.977519 | 0.523 |
| 8744.956333 | 0.522 |
| 8754.933058 | 0.52 |
| 8764.907692 | 0.52 |
| 8774.880232 | 0.519 |
| 8784.850677 | 0.519 |
| 8794.819025 | 0.518 |
| 8804.785271 | 0.517 |
| 8815.461059 | 0.516 |
| 8825.422948 | 0.516 |
| 8835.382728 | 0.515 |
| 8845.340399 | 0.514 |
| 8855.295957 | 0.514 |
| 8865.249401 | 0.513 |
| 8875.200727 | 0.512 |
| 8885.149933 | 0.512 |
| 8895.097018 | 0.511 |
| 8905.041978 | 0.51 |
| 8914.984812 | 0.509 |
| 8924.925517 | 0.509 |
| 8934.86409 | 0.508 |
| 8944.800529 | 0.508 |
| 8954.734832 | 0.507 |
| 8965.376355 | 0.506 |
| 8975.306225 | 0.505 |
| 8985.233952 | 0.504 |
| 8995.159534 | 0.503 |
| 9005.082967 | 0.502 |
| 9015.004249 | 0.501 |
| 9024.923378 | 0.501 |
| 9034.840353 | 0.5 |
| 9044.755169 | 0.499 |
| 9054.667825 | 0.499 |
| 9065.286129 | 0.498 |
| 9075.194303 | 0.497 |
| 9085.10031 | 0.496 |
| 9095.004147 | 0.495 |
| 9104.905813 | 0.494 |
| 9114.805303 | 0.494 |
| 9124.702617 | 0.494 |
| 9134.597752 | 0.493 |
| 9145.197262 | 0.492 |
| 9155.087875 | 0.492 |
| 9164.976302 | 0.491 |
| 9174.86254 | 0.491 |
| 9184.746587 | 0.491 |
| 9194.628441 | 0.491 |
| 9204.508098 | 0.491 |
| 9215.091006 | 0.49 |
| 9224.966108 | 0.489 |
| 9234.839006 | 0.489 |
| 9244.709699 | 0.488 |
| 9254.578185 | 0.487 |
| 9265.149109 | 0.487 |
| 9275.013013 | 0.487 |
| 9284.874702 | 0.486 |
| 9294.734174 | 0.486 |
| 9304.591426 | 0.485 |
| 9314.446456 | 0.484 |
| 9325.002949 | 0.484 |
| 9334.853368 | 0.483 |
| 9344.701558 | 0.482 |
| 9354.547517 | 0.481 |
| 9364.391241 | 0.48 |
| 9374.935607 | 0.48 |
| 9384.774696 | 0.479 |
| 9394.611544 | 0.478 |
| 9404.446148 | 0.478 |
| 9414.980732 | 0.477 |
| 9424.810682 | 0.476 |
| 9434.63838 | 0.476 |
| 9444.463825 | 0.475 |
| 9454.988585 | 0.475 |
| 9464.809356 | 0.475 |
| 9474.627866 | 0.474 |
| 9484.444114 | 0.473 |
| 9494.959008 | 0.472 |
| 9504.770561 | 0.472 |
| 9514.579844 | 0.471 |
| 9524.386855 | 0.47 |
| 9534.891842 | 0.47 |
| 9544.694139 | 0.469 |
| 9554.494156 | 0.469 |
| 9564.291891 | 0.468 |
| 9574.786929 | 0.468 |
| 9584.57993 | 0.467 |
| 9594.370643 | 0.467 |
| 9604.858149 | 0.466 |
| 9614.644112 | 0.466 |
| 9624.427779 | 0.466 |
| 9634.209147 | 0.465 |
| 9644.686632 | 0.465 |
| 9654.463232 | 0.464 |
| 9664.237526 | 0.463 |
| 9674.707423 | 0.463 |
| 9684.476934 | 0.463 |
| 9694.244132 | 0.463 |
| 9704.706417 | 0.462 |
| 9714.468817 | 0.461 |
| 9724.228897 | 0.461 |
| 9734.683548 | 0.46 |
| 9744.438814 | 0.459 |
| 9754.191753 | 0.459 |
| 9764.638746 | 0.458 |
| 9774.386857 | 0.458 |
| 9784.132634 | 0.457 |
| 9794.571945 | 0.456 |
| 9804.312879 | 0.456 |
| 9814.746996 | 0.455 |
| 9824.483078 | 0.455 |
| 9834.216813 | 0.454 |
| 9844.643209 | 0.454 |
| 9854.372076 | 0.453 |
| 9864.09859 | 0.453 |
| 9874.517241 | 0.453 |
| 9884.238873 | 0.452 |
| 9894.652288 | 0.452 |
| 9904.369027 | 0.451 |
| 9914.083402 | 0.451 |
| 9924.489032 | 0.45 |
| 9934.198499 | 0.45 |
| 9944.598867 | 0.449 |
| 9954.303417 | 0.449 |
| 9964.00559 | 0.448 |
| 9974.398135 | 0.448 |
| 9984.095376 | 0.447 |
| 9994.482631 | 0.447 |
| 10004.17493 | 0.447 |
| 10014.55689 | 0.447 |
| 10024.24423 | 0.446 |
| 10033.92919 | 0.445 |
| 10044.30326 | 0.445 |
| 10053.98325 | 0.445 |
| 10064.352 | 0.444 |
| 10074.02701 | 0.444 |
| 10084.39043 | 0.444 |
| 10094.06045 | 0.444 |
| 10104.41852 | 0.444 |
| 10114.08355 | 0.444 |
| 10124.43625 | 0.443 |
| 10134.09628 | 0.443 |
| 10144.44362 | 0.442 |
| 10154.09862 | 0.441 |
| 10164.44058 | 0.441 |
| 10174.09056 | 0.44 |
| 10184.42713 | 0.44 |
| 10194.07208 | 0.439 |
| 10204.40325 | 0.439 |
| 10214.04315 | 0.438 |
| 10224.36891 | 0.438 |
| 10234.00375 | 0.437 |
| 10244.32409 | 0.436 |
| 10253.95386 | 0.436 |
| 10264.26877 | 0.435 |
| 10273.89347 | 0.434 |
| 10284.20293 | 0.434 |
| 10293.82255 | 0.433 |
| 10304.12656 | 0.433 |
| 10313.74108 | 0.432 |
| 10324.03963 | 0.432 |
| 10334.33534 | 0.431 |
| 10343.94211 | 0.431 |
| 10354.23234 | 0.431 |
| 10363.834 | 0.43 |
| 10374.11874 | 0.43 |
| 10383.71527 | 0.429 |
| 10393.99451 | 0.429 |
| 10404.2709 | 0.428 |
| 10413.85962 | 0.428 |
| 10424.1305 | 0.428 |
| 10433.71407 | 0.428 |
| 10443.97941 | 0.427 |
| 10454.2419 | 0.427 |
| 10463.81763 | 0.427 |
| 10474.07457 | 0.427 |
| 10483.64512 | 0.426 |
| 10493.8965 | 0.426 |
| 10504.14501 | 0.425 |
| 10513.70769 | 0.425 |
| 10523.95063 | 0.424 |
| 10534.19068 | 0.423 |
| 10543.74545 | 0.423 |
| 10553.97992 | 0.422 |
| 10564.21149 | 0.422 |
| 10573.75835 | 0.421 |
| 10583.98432 | 0.421 |
| 10593.52594 | 0.421 |
| 10603.7463 | 0.42 |
| 10613.96375 | 0.42 |
| 10624.17829 | 0.42 |
| 10633.70924 | 0.42 |
| 10643.91815 | 0.419 |
| 10654.12414 | 0.419 |
| 10663.64709 | 0.418 |
| 10673.84743 | 0.417 |
| 10684.04485 | 0.417 |
| 10693.55979 | 0.416 |
| 10703.75154 | 0.416 |
| 10713.94035 | 0.416 |
| 10723.44726 | 0.415 |
| 10733.6304 | 0.415 |
| 10743.81059 | 0.414 |
| 10753.98783 | 0.414 |
| 10763.48393 | 0.414 |
| 10773.65548 | 0.413 |
| 10783.82407 | 0.413 |
| 10793.9897 | 0.413 |
| 10803.47495 | 0.412 |
| 10813.63486 | 0.412 |
| 10823.7918 | 0.412 |
| 10833.94578 | 0.412 |
| 10843.42014 | 0.412 |
| 10853.56838 | 0.411 |
| 10863.71363 | 0.411 |
| 10873.85591 | 0.411 |
| 10883.31935 | 0.411 |
| 10893.45586 | 0.41 |
| 10903.58938 | 0.411 |
| 10913.71992 | 0.41 |
| 10923.84746 | 0.41 |
| 10933.29714 | 0.41 |
| 10943.41889 | 0.409 |
| 10953.53764 | 0.409 |
| 10963.65339 | 0.408 |
| 10973.76613 | 0.408 |
| 10983.87586 | 0.408 |
| 10993.3089 | 0.408 |
| 11003.41281 | 0.407 |
| 11013.5137 | 0.407 |
| 11023.61157 | 0.407 |
| 11033.70642 | 0.407 |
| 11043.79825 | 0.407 |
| 11053.21456 | 0.407 |
| 11063.30053 | 0.407 |
| 11073.38346 | 0.406 |
| 11083.46337 | 0.406 |
| 11093.54023 | 0.406 |
| 11103.61405 | 0.405 |
| 11113.68483 | 0.405 |
| 11123.75256 | 0.405 |
| 11133.14635 | 0.404 |
| 11143.20819 | 0.404 |
| 11153.26696 | 0.404 |
| 11163.32268 | 0.403 |
| 11173.37534 | 0.403 |
| 11183.42494 | 0.403 |
| 11193.47147 | 0.403 |
| 11203.51493 | 0.403 |
| 11213.55532 | 0.402 |
| 11223.59263 | 0.402 |
| 11233.62687 | 0.402 |
| 11243.65803 | 0.402 |
| 11253.6861 | 0.402 |
| 11263.71109 | 0.402 |
| 11273.06496 | 0.401 |
| 11283.08398 | 0.401 |
| 11293.09991 | 0.401 |
| 11303.11274 | 0.401 |
| 11313.12247 | 0.4 |
| 11323.12909 | 0.4 |
| 11333.13262 | 0.4 |
| 11343.13303 | 0.4 |
| 11353.13034 | 0.399 |
| 11363.12453 | 0.399 |
| 11373.11561 | 0.399 |
| 11383.10358 | 0.398 |
| 11393.08842 | 0.398 |
| 11403.07013 | 0.398 |
| 11413.04872 | 0.398 |
| 11423.02418 | 0.398 |
| 11432.99651 | 0.398 |
| 11442.96571 | 0.398 |
| 11452.93177 | 0.398 |
| 11463.55877 | 0.398 |
| 11473.51834 | 0.398 |
| 11483.47476 | 0.397 |
| 11493.42803 | 0.397 |
| 11503.37815 | 0.396 |
| 11513.32512 | 0.397 |
| 11523.26893 | 0.396 |
| 11533.20958 | 0.396 |
| 11543.14707 | 0.396 |
| 11553.0814 | 0.396 |
| 11563.01256 | 0.396 |
| 11572.94055 | 0.396 |
| 11582.86536 | 0.396 |
| 11593.44833 | 0.396 |
| 11603.36658 | 0.395 |
| 11613.28165 | 0.395 |
| 11623.19353 | 0.395 |
| 11633.10223 | 0.394 |
| 11643.00774 | 0.394 |
| 11652.91006 | 0.394 |
| 11662.80918 | 0.393 |
| 11673.36472 | 0.393 |
| 11683.25723 | 0.393 |
| 11693.14654 | 0.393 |
| 11703.03264 | 0.393 |
| 11712.91554 | 0.393 |
| 11722.79522 | 0.392 |
| 11733.33001 | 0.392 |
| 11743.20304 | 0.392 |
| 11753.07286 | 0.392 |
| 11762.93946 | 0.393 |
| 11772.80283 | 0.392 |
| 11783.3202 | 0.392 |
| 11793.1769 | 0.392 |
| 11803.03036 | 0.391 |
| 11812.88059 | 0.392 |
| 11822.72758 | 0.392 |
| 11833.22747 | 0.391 |
| 11843.06776 | 0.391 |
| 11852.9048 | 0.391 |
| 11862.73859 | 0.391 |
| 11873.22439 | 0.391 |
| 11883.05145 | 0.391 |
| 11892.87526 | 0.391 |
| 11902.69581 | 0.39 |
| 11913.16747 | 0.39 |
| 11922.98127 | 0.39 |
| 11932.79181 | 0.39 |
| 11942.59907 | 0.39 |
| 11953.05654 | 0.39 |
| 11962.85704 | 0.39 |
| 11972.65425 | 0.389 |
| 11983.10099 | 0.389 |
| 11992.89142 | 0.388 |
| 12002.67856 | 0.388 |
| 12013.11455 | 0.388 |
| 12022.89488 | 0.387 |
| 12032.67192 | 0.387 |
| 12043.09713 | 0.387 |
| 12052.86735 | 0.387 |
| 12062.63426 | 0.387 |
| 12073.04866 | 0.387 |
| 12082.80874 | 0.387 |
| 12092.5655 | 0.387 |
| 12102.96906 | 0.386 |
| 12112.71897 | 0.386 |
| 12122.46556 | 0.386 |
| 12132.85826 | 0.386 |
| 12142.59798 | 0.385 |
| 12152.98334 | 0.385 |
| 12162.71618 | 0.385 |
| 12172.44568 | 0.384 |
| 12182.82013 | 0.384 |
| 12192.54273 | 0.384 |
| 12202.90982 | 0.383 |
| 12212.62551 | 0.383 |
| 12222.98523 | 0.383 |
| 12232.69399 | 0.383 |
| 12242.39941 | 0.383 |
| 12252.74815 | 0.383 |
| 12262.44662 | 0.383 |
| 12272.78796 | 0.382 |
| 12282.47948 | 0.382 |
| 12292.81339 | 0.382 |
| 12302.49796 | 0.382 |
| 12312.82444 | 0.381 |
| 12322.50203 | 0.382 |
| 12332.82106 | 0.382 |
| 12342.49167 | 0.381 |
| 12352.80325 | 0.381 |
| 12362.46686 | 0.381 |
| 12372.77097 | 0.38 |
| 12382.42757 | 0.38 |
| 12392.7242 | 0.38 |
| 12402.37378 | 0.379 |
| 12412.66292 | 0.379 |
| 12422.30547 | 0.379 |
| 12432.58711 | 0.379 |
| 12442.22262 | 0.379 |
| 12452.49673 | 0.379 |
| 12462.76697 | 0.379 |
| 12472.39178 | 0.378 |
| 12482.65448 | 0.378 |
| 12492.27222 | 0.378 |
| 12502.52738 | 0.378 |
| 12512.77863 | 0.378 |
| 12522.38563 | 0.378 |
| 12532.62932 | 0.378 |
| 12542.22922 | 0.377 |
| 12552.46533 | 0.377 |
| 12562.69753 | 0.377 |
| 12572.28665 | 0.376 |
| 12582.51125 | 0.376 |
| 12592.73192 | 0.376 |
| 12602.31024 | 0.376 |
| 12612.5233 | 0.376 |
| 12622.09447 | 0.376 |
| 12632.29991 | 0.376 |
| 12642.5014 | 0.376 |
| 12652.69895 | 0.375 |
| 12662.25557 | 0.375 |
| 12672.44547 | 0.375 |
| 12682.63142 | 0.374 |
| 12692.17715 | 0.374 |
| 12702.35544 | 0.374 |
| 12712.52975 | 0.374 |
| 12722.06458 | 0.374 |
| 12732.23121 | 0.374 |
| 12742.39387 | 0.374 |
| 12752.55256 | 0.374 |
| 12762.07271 | 0.375 |
| 12772.22369 | 0.374 |
| 12782.37068 | 0.374 |
| 12792.51369 | 0.375 |
| 12802.01913 | 0.375 |
| 12812.1544 | 0.374 |
| 12822.28568 | 0.374 |
| 12832.41295 | 0.374 |
| 12842.53622 | 0.374 |
| 12852.02315 | 0.374 |
| 12862.13866 | 0.373 |
| 12872.25016 | 0.373 |
| 12882.35764 | 0.373 |
| 12892.4611 | 0.373 |
| 12901.92944 | 0.372 |
| 12912.02511 | 0.372 |
| 12922.11675 | 0.372 |
| 12932.20436 | 0.372 |
| 12942.28794 | 0.371 |
| 12952.36747 | 0.372 |
| 12962.44297 | 0.372 |
| 12971.88508 | 0.372 |
| 12981.95274 | 0.372 |
| 12992.01635 | 0.372 |
| 13002.07591 | 0.371 |
| 13012.13141 | 0.371 |
| 13022.18286 | 0.371 |
| 13032.23024 | 0.371 |
| 13042.27356 | 0.371 |
| 13052.31281 | 0.371 |
| 13062.34799 | 0.371 |
| 13072.37909 | 0.371 |
| 13081.77955 | 0.371 |
| 13091.80275 | 0.371 |
| 13101.82186 | 0.371 |
| 13111.83689 | 0.37 |
| 13121.84783 | 0.37 |
| 13131.85468 | 0.37 |
| 13141.85743 | 0.37 |
| 13151.85608 | 0.37 |
| 13161.85063 | 0.369 |
| 13171.84107 | 0.369 |
| 13181.8274 | 0.369 |
| 13191.80963 | 0.369 |
| 13201.78774 | 0.369 |
| 13211.76172 | 0.368 |
| 13221.73159 | 0.368 |
| 13231.69734 | 0.368 |
| 13241.65895 | 0.368 |
| 13252.23865 | 0.368 |
| 13262.19174 | 0.368 |
| 13272.1407 | 0.367 |
| 13282.08552 | 0.367 |
| 13292.02619 | 0.367 |
| 13301.96272 | 0.367 |
| 13311.8951 | 0.367 |
| 13321.82333 | 0.366 |
| 13331.7474 | 0.367 |
| 13341.66731 | 0.367 |
| 13351.58306 | 0.367 |
| 13362.11398 | 0.367 |
| 13372.02114 | 0.367 |
| 13381.92413 | 0.367 |
| 13391.82294 | 0.366 |
| 13401.71758 | 0.366 |
| 13411.60803 | 0.366 |
| 13422.11206 | 0.366 |
| 13431.99388 | 0.366 |
| 13441.87151 | 0.366 |
| 13451.74495 | 0.365 |
| 13461.6142 | 0.365 |
| 13472.09567 | 0.365 |
| 13481.95625 | 0.365 |
| 13491.81263 | 0.365 |
| 13501.66479 | 0.365 |
| 13511.51275 | 0.365 |
| 13521.97158 | 0.365 |
| 13531.81084 | 0.365 |
| 13541.64588 | 0.365 |
| 13551.47669 | 0.364 |
| 13561.9173 | 0.364 |
| 13571.7394 | 0.364 |
| 13581.55725 | 0.364 |
| 13591.98409 | 0.364 |
| 13601.79321 | 0.364 |
| 13611.59808 | 0.364 |
| 13621.39871 | 0.363 |
| 13631.80722 | 0.364 |
| 13641.59909 | 0.364 |
| 13651.38669 | 0.364 |
| 13661.78136 | 0.363 |
| 13671.56018 | 0.364 |
| 13681.94551 | 0.364 |
| 13691.71553 | 0.363 |
| 13701.48128 | 0.363 |
| 13711.85271 | 0.363 |
| 13721.60964 | 0.363 |
| 13731.3623 | 0.363 |
| 13741.7198 | 0.363 |
| 13751.46361 | 0.363 |
| 13761.81172 | 0.362 |
| 13771.54668 | 0.362 |
| 13781.88538 | 0.362 |
| 13791.61148 | 0.362 |
| 13801.33328 | 0.361 |
| 13811.65798 | 0.361 |
| 13821.37089 | 0.361 |
| 13831.68615 | 0.362 |
| 13841.39017 | 0.362 |
| 13851.69596 | 0.362 |
| 13861.39108 | 0.362 |
| 13871.6874 | 0.362 |
| 13881.37359 | 0.362 |
| 13891.66043 | 0.362 |
| 13901.33769 | 0.362 |
| 13911.61502 | 0.362 |
| 13921.28334 | 0.361 |
| 13931.55116 | 0.362 |
| 13941.21051 | 0.362 |
| 13951.46881 | 0.362 |
| 13961.72219 | 0.362 |
| 13971.36795 | 0.362 |
| 13981.61179 | 0.362 |
| 13991.24855 | 0.362 |
| 14001.48283 | 0.363 |
| 14011.71217 | 0.363 |
| 14021.33529 | 0.362 |
| 14031.55505 | 0.362 |
| 14041.16914 | 0.362 |
| 14051.37931 | 0.362 |
| 14061.58453 | 0.362 |
| 14071.18493 | 0.362 |
| 14081.38053 | 0.362 |
| 14091.57118 | 0.362 |
| 14101.15785 | 0.362 |
| 14111.33886 | 0.362 |
| 14121.51491 | 0.362 |
| 14131.08782 | 0.362 |
| 14141.25421 | 0.362 |
| 14151.41561 | 0.362 |
| 14161.57204 | 0.362 |
| 14171.12647 | 0.361 |
| 14181.27321 | 0.361 |
| 14191.41496 | 0.361 |
| 14201.55171 | 0.361 |
| 14211.08762 | 0.361 |
| 14221.21466 | 0.361 |
| 14231.33669 | 0.362 |
| 14241.45371 | 0.361 |
| 14250.97103 | 0.362 |
| 14261.07831 | 0.362 |
| 14271.18057 | 0.362 |
| 14281.27781 | 0.362 |
| 14291.37001 | 0.363 |
| 14301.45718 | 0.363 |
| 14310.94639 | 0.363 |
| 14321.02379 | 0.363 |
| 14331.09614 | 0.363 |
| 14341.16344 | 0.363 |
| 14351.2257 | 0.363 |
| 14361.2829 | 0.363 |
| 14371.33504 | 0.363 |
| 14381.38213 | 0.363 |
| 14391.42415 | 0.363 |
| 14400.87083 | 0.363 |
| 14410.90301 | 0.363 |
| 14420.93011 | 0.363 |
| 14430.95214 | 0.363 |
| 14440.96908 | 0.364 |
| 14450.98094 | 0.364 |
| 14460.98771 | 0.363 |
| 14470.98939 | 0.363 |
| 14480.98597 | 0.363 |
| 14490.97745 | 0.362 |
| 14500.96383 | 0.363 |
| 14510.9451 | 0.363 |
| 14520.92127 | 0.364 |
| 14530.89232 | 0.364 |
| 14540.85825 | 0.364 |
| 14550.81906 | 0.365 |
| 14560.77475 | 0.365 |
| 14571.31048 | 0.366 |
| 14581.25561 | 0.366 |
| 14591.19561 | 0.367 |
| 14601.13046 | 0.367 |
| 14611.06018 | 0.367 |
| 14620.98475 | 0.367 |
| 14630.90417 | 0.367 |
| 14640.81844 | 0.367 |
| 14650.72755 | 0.367 |
| 14661.21393 | 0.367 |
| 14671.11242 | 0.367 |
| 14681.00574 | 0.368 |
| 14690.89389 | 0.37 |
| 14700.77687 | 0.371 |
| 14710.65467 | 0.372 |
| 14721.10787 | 0.372 |
| 14730.975 | 0.372 |
| 14740.83695 | 0.373 |
| 14750.6937 | 0.375 |
| 14761.12461 | 0.376 |
| 14770.97066 | 0.375 |
| 14780.81152 | 0.376 |
| 14790.64717 | 0.376 |
| 14801.05571 | 0.376 |
| 14810.88064 | 0.376 |
| 14820.70034 | 0.376 |
| 14831.09199 | 0.376 |
| 14840.90095 | 0.376 |
| 14850.70469 | 0.376 |
| 14861.07941 | 0.376 |
| 14870.87237 | 0.376 |
| 14880.6601 | 0.376 |
| 14891.01786 | 0.376 |
| 14900.7948 | 0.376 |
| 14910.56649 | 0.377 |
| 14920.90726 | 0.377 |
| 14930.66813 | 0.378 |
| 14940.99744 | 0.379 |
| 14950.74749 | 0.379 |
| 14960.49227 | 0.379 |
| 14970.80453 | 0.379 |
| 14980.53846 | 0.379 |
| 14990.83922 | 0.38 |
| 15000.56229 | 0.379 |
| 15010.85154 | 0.381 |
| 15020.56373 | 0.381 |
| 15030.84146 | 0.382 |
| 15040.54275 | 0.382 |
| 15050.80894 | 0.383 |
| 15060.49932 | 0.384 |
| 15070.75395 | 0.385 |
| 15080.43342 | 0.385 |
| 15090.67647 | 0.385 |
| 15100.91357 | 0.385 |
| 15110.57647 | 0.385 |
| 15120.80197 | 0.386 |
| 15130.45391 | 0.387 |
| 15140.6678 | 0.388 |
| 15150.87571 | 0.387 |
| 15160.51103 | 0.387 |
| 15170.70731 | 0.387 |
| 15180.33163 | 0.388 |
| 15190.51626 | 0.388 |
| 15200.69489 | 0.388 |
| 15210.30253 | 0.389 |
| 15220.4695 | 0.39 |
| 15230.63045 | 0.39 |
| 15240.78539 | 0.39 |
| 15250.37064 | 0.389 |
| 15260.51388 | 0.389 |
| 15270.65109 | 0.39 |
| 15280.78227 | 0.39 |
| 15290.34507 | 0.391 |
| 15300.46452 | 0.391 |
| 15310.57793 | 0.391 |
| 15320.6853 | 0.391 |
| 15330.22559 | 0.391 |
| 15340.32119 | 0.392 |
| 15350.41073 | 0.392 |
| 15360.49422 | 0.392 |
| 15370.57164 | 0.393 |
| 15380.64299 | 0.393 |
| 15390.70827 | 0.393 |
| 15400.20879 | 0.394 |
| 15410.26225 | 0.394 |
| 15420.30963 | 0.394 |
| 15430.35092 | 0.395 |
| 15440.38612 | 0.395 |
| 15450.41522 | 0.395 |
| 15460.43823 | 0.395 |
| 15470.45513 | 0.395 |
| 15480.46592 | 0.396 |
| 15490.4706 | 0.397 |
| 15500.46917 | 0.398 |
| 15510.46161 | 0.397 |
| 15520.44794 | 0.398 |
| 15530.42813 | 0.398 |
| 15540.4022 | 0.398 |
| 15550.37013 | 0.398 |
| 15560.33192 | 0.397 |
| 15570.28757 | 0.399 |
| 15580.23707 | 0.4 |
| 15590.18042 | 0.4 |
| 15600.11761 | 0.401 |
| 15610.04865 | 0.402 |
| 15620.52472 | 0.403 |
| 15630.44309 | 0.403 |
| 15640.35528 | 0.403 |
| 15650.2613 | 0.402 |
| 15660.16114 | 0.402 |
| 15670.0548 | 0.402 |
| 15680.4914 | 0.402 |
| 15690.37234 | 0.402 |
| 15700.24708 | 0.402 |
| 15710.11563 | 0.403 |
| 15719.97797 | 0.403 |
| 15730.38149 | 0.402 |
| 15740.23107 | 0.402 |
| 15750.07444 | 0.403 |
| 15759.91159 | 0.404 |
| 15770.2885 | 0.404 |
| 15780.11286 | 0.404 |
| 15789.93098 | 0.403 |
| 15800.2878 | 0.403 |
| 15810.09311 | 0.403 |
| 15819.89218 | 0.404 |
| 15830.22886 | 0.403 |
| 15840.01509 | 0.404 |
| 15850.33821 | 0.404 |
| 15860.11158 | 0.404 |
| 15869.87869 | 0.404 |
| 15880.18161 | 0.404 |
| 15889.93584 | 0.404 |
| 15900.22516 | 0.404 |
| 15909.96648 | 0.404 |
| 15920.24218 | 0.405 |
| 15929.97059 | 0.405 |
| 15940.23264 | 0.405 |
| 15949.94812 | 0.405 |
| 15960.19652 | 0.405 |
| 15969.89905 | 0.405 |
| 15980.13377 | 0.406 |
| 15989.82334 | 0.406 |
| 16000.04436 | 0.406 |